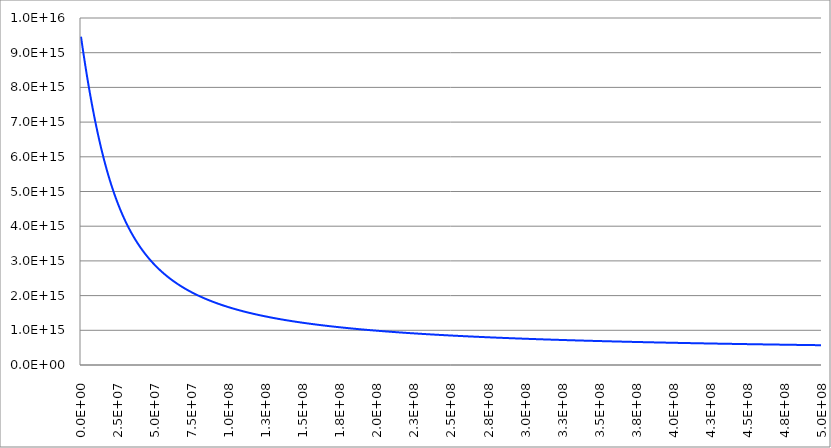
| Category | Series 1 | Series 0 | Series 2 |
|---|---|---|---|
| 0.0 |  |  | 9460730472580800 |
| 250000.0 |  |  | 9386088602967600 |
| 500000.0 |  |  | 9312059161777870 |
| 750000.0 |  |  | 9238641965022600 |
| 1000000.0 |  |  | 9165836706258070 |
| 1250000.0 |  |  | 9093642956892360 |
| 1500000.0 |  |  | 9022060166613310 |
| 1750000.0 |  |  | 8951087663937220 |
| 2000000.0 |  |  | 8880724656876750 |
| 2250000.0 |  |  | 8810970233726620 |
| 2500000.0 |  |  | 8741823363965320 |
| 2750000.0 |  |  | 8673282899270600 |
| 3000000.0 |  |  | 8605347574646660 |
| 3250000.0 |  |  | 8538016009660190 |
| 3500000.0 |  |  | 8471286709782780 |
| 3750000.0 |  |  | 8405158067836470 |
| 4000000.0 |  |  | 8339628365539280 |
| 4250000.0 |  |  | 8274695775147360 |
| 4500000.0 |  |  | 8210358361190130 |
| 4750000.0 |  |  | 8146614082294670 |
| 5000000.0 |  |  | 8083460793095420 |
| 5250000.0 |  |  | 8020896246225210 |
| 5500000.0 |  |  | 7958918094383340 |
| 5750000.0 |  |  | 7897523892476560 |
| 6000000.0 |  |  | 7836711099828500 |
| 6250000.0 |  |  | 7776477082453110 |
| 6500000.0 |  |  | 7716819115387610 |
| 6750000.0 |  |  | 7657734385080410 |
| 7000000.0 |  |  | 7599219991829400 |
| 7250000.0 |  |  | 7541272952265950 |
| 7500000.0 |  |  | 7483890201880120 |
| 7750000.0 |  |  | 7427068597582410 |
| 8000000.0 |  |  | 7370804920297470 |
| 8250000.0 |  |  | 7315095877585250 |
| 8500000.0 |  |  | 7259938106285140 |
| 8750000.0 |  |  | 7205328175178670 |
| 9000000.0 |  |  | 7151262587666280 |
| 9250000.0 |  |  | 7097737784454180 |
| 9500000.0 |  |  | 7044750146246840 |
| 9750000.0 |  |  | 6992295996441190 |
| 10000000.0 |  |  | 6940371603818580 |
| 10250000.0 |  |  | 6888973185230630 |
| 10500000.0 |  |  | 6838096908275190 |
| 10750000.0 |  |  | 6787738893959010 |
| 11000000.0 |  |  | 6737895219343470 |
| 11250000.0 |  |  | 6688561920170280 |
| 11500000.0 |  |  | 6639734993463790 |
| 11750000.0 |  |  | 6591410400107120 |
| 12000000.0 |  |  | 6543584067389070 |
| 12250000.0 |  |  | 6496251891519320 |
| 12500000.0 |  |  | 6449409740109170 |
| 12750000.0 |  |  | 6403053454615630 |
| 13000000.0 |  |  | 6357178852746540 |
| 13250000.0 |  |  | 6311781730824640 |
| 13500000.0 |  |  | 6266857866108840 |
| 13750000.0 |  |  | 6222403019070650 |
| 14000000.0 |  |  | 6178412935624510 |
| 14250000.0 |  |  | 6134883349310280 |
| 14500000.0 |  |  | 6091809983426770 |
| 14750000.0 |  |  | 6049188553115090 |
| 15000000.0 |  |  | 6007014767390770 |
| 15250000.0 |  |  | 5965284331123830 |
| 15500000.0 |  |  | 5923992946966010 |
| 15750000.0 |  |  | 5883136317224540 |
| 16000000.0 |  |  | 5842710145682030 |
| 16250000.0 |  |  | 5802710139361940 |
| 16500000.0 |  |  | 5763132010239590 |
| 16750000.0 |  |  | 5723971476898300 |
| 17000000.0 |  |  | 5685224266130920 |
| 17250000.0 |  |  | 5646886114486450 |
| 17500000.0 |  |  | 5608952769762230 |
| 17750000.0 |  |  | 5571419992441700 |
| 18000000.0 |  |  | 5534283557078210 |
| 18250000.0 |  |  | 5497539253625100 |
| 18500000.0 |  |  | 5461182888712780 |
| 18750000.0 |  |  | 5425210286873070 |
| 19000000.0 |  |  | 5389617291711630 |
| 19250000.0 |  |  | 5354399767029040 |
| 19500000.0 |  |  | 5319553597891310 |
| 19750000.0 |  |  | 5285074691650480 |
| 20000000.0 |  |  | 5250958978916320 |
| 20250000.0 |  |  | 5217202414479810 |
| 20500000.0 |  |  | 5183800978189420 |
| 20750000.0 |  |  | 5150750675781010 |
| 21000000.0 |  |  | 5118047539662500 |
| 21250000.0 |  |  | 5085687629654040 |
| 21500000.0 |  |  | 5053667033684950 |
| 21750000.0 |  |  | 5021981868448260 |
| 22000000.0 |  |  | 4990628280014020 |
| 22250000.0 |  |  | 4959602444402380 |
| 22500000.0 |  |  | 4928900568117510 |
| 22750000.0 |  |  | 4898518888643500 |
| 23000000.0 |  |  | 4868453674903220 |
| 23250000.0 |  |  | 4838701227681260 |
| 23500000.0 |  |  | 4809257880012120 |
| 23750000.0 |  |  | 4780119997534550 |
| 24000000.0 |  |  | 4751283978813310 |
| 24250000.0 |  |  | 4722746255629240 |
| 24500000.0 |  |  | 4694503293238850 |
| 24750000.0 |  |  | 4666551590604380 |
| 25000000.0 |  |  | 4638887680595390 |
| 25250000.0 |  |  | 4611508130162970 |
| 25500000.0 |  |  | 4584409540487470 |
| 25750000.0 |  |  | 4557588547100840 |
| 26000000.0 |  |  | 4531041819984540 |
| 26250000.0 |  |  | 4504766063643960 |
| 26500000.0 |  |  | 4478758017160300 |
| 26750000.0 |  |  | 4453014454220860 |
| 27000000.0 |  |  | 4427532183128710 |
| 27250000.0 |  |  | 4402308046792420 |
| 27500000.0 |  |  | 4377338922697000 |
| 27750000.0 |  |  | 4352621722856700 |
| 28000000.0 |  |  | 4328153393750530 |
| 28250000.0 |  |  | 4303930916241510 |
| 28500000.0 |  |  | 4279951305479990 |
| 28750000.0 |  |  | 4256211610792390 |
| 29000000.0 |  |  | 4232708915555590 |
| 29250000.0 |  |  | 4209440337058030 |
| 29500000.0 |  |  | 4186403026348040 |
| 29750000.0 |  |  | 4163594168070180 |
| 30000000.0 |  |  | 4141010980290260 |
| 30250000.0 |  |  | 4118650714309520 |
| 30500000.0 |  |  | 4096510654468860 |
| 30750000.0 |  |  | 4074588117943460 |
| 31000000.0 |  |  | 4052880454528580 |
| 31250000.0 |  |  | 4031385046416900 |
| 31500000.0 |  |  | 4010099307968140 |
| 31750000.0 |  |  | 3989020685471360 |
| 32000000.0 |  |  | 3968146656900440 |
| 32250000.0 |  |  | 3947474731663300 |
| 32500000.0 |  |  | 3927002450345250 |
| 32750000.0 |  |  | 3906727384447010 |
| 33000000.0 |  |  | 3886647136117700 |
| 33250000.0 |  |  | 3866759337883350 |
| 33500000.0 |  |  | 3847061652371220 |
| 33750000.0 |  |  | 3827551772030440 |
| 34000000.0 |  |  | 3808227418849120 |
| 34250000.0 |  |  | 3789086344068580 |
| 34500000.0 |  |  | 3770126327894770 |
| 34750000.0 |  |  | 3751345179207310 |
| 35000000.0 |  |  | 3732740735266480 |
| 35250000.0 |  |  | 3714310861418450 |
| 35500000.0 |  |  | 3696053450798930 |
| 35750000.0 |  |  | 3677966424035660 |
| 36000000.0 |  |  | 3660047728949900 |
| 36250000.0 |  |  | 3642295340257110 |
| 36500000.0 |  |  | 3624707259267270 |
| 36750000.0 |  |  | 3607281513584780 |
| 37000000.0 |  |  | 3590016156808320 |
| 37250000.0 |  |  | 3572909268230860 |
| 37500000.0 |  |  | 3555958952539980 |
| 37750000.0 |  |  | 3539163339518610 |
| 38000000.0 |  |  | 3522520583746510 |
| 38250000.0 |  |  | 3506028864302490 |
| 38500000.0 |  |  | 3489686384467680 |
| 38750000.0 |  |  | 3473491371429790 |
| 39000000.0 |  |  | 3457442075988780 |
| 39250000.0 |  |  | 3441536772263710 |
| 39500000.0 |  |  | 3425773757401200 |
| 39750000.0 |  |  | 3410151351285480 |
| 40000000.0 |  |  | 3394667896250070 |
| 40250000.0 |  |  | 3379321756791350 |
| 40500000.0 |  |  | 3364111319283950 |
| 40750000.0 |  |  | 3349034991698160 |
| 41000000.0 |  |  | 3334091203319370 |
| 41250000.0 |  |  | 3319278404469670 |
| 41500000.0 |  |  | 3304595066231600 |
| 41750000.0 |  |  | 3290039680174200 |
| 42000000.0 |  |  | 3275610758081370 |
| 42250000.0 |  |  | 3261306831682580 |
| 42500000.0 |  |  | 3247126452386020 |
| 42750000.0 |  |  | 3233068191014200 |
| 43000000.0 |  |  | 3219130637542090 |
| 43250000.0 |  |  | 3205312400837740 |
| 43500000.0 |  |  | 3191612108405520 |
| 43750000.0 |  |  | 3178028406131930 |
| 44000000.0 |  |  | 3164559958034090 |
| 44250000.0 |  |  | 3151205446010800 |
| 44500000.0 |  |  | 3137963569596320 |
| 44750000.0 |  |  | 3124833045716850 |
| 45000000.0 |  |  | 3111812608449650 |
| 45250000.0 |  |  | 3098901008784920 |
| 45500000.0 |  |  | 3086097014390370 |
| 45750000.0 |  |  | 3073399409378540 |
| 46000000.0 |  |  | 3060806994076810 |
| 46250000.0 |  |  | 3048318584800160 |
| 46500000.0 |  |  | 3035933013626630 |
| 46750000.0 |  |  | 3023649128175600 |
| 47000000.0 |  |  | 3011465791388650 |
| 47250000.0 |  |  | 2999381881313240 |
| 47500000.0 |  |  | 2987396290889040 |
| 47750000.0 |  |  | 2975507927737020 |
| 48000000.0 |  |  | 2963715713951170 |
| 48250000.0 |  |  | 2952018585892920 |
| 48500000.0 |  |  | 2940415493988200 |
| 48750000.0 |  |  | 2928905402527240 |
| 49000000.0 |  |  | 2917487289466840 |
| 49250000.0 |  |  | 2906160146235470 |
| 49500000.0 |  |  | 2894922977540760 |
| 49750000.0 |  |  | 2883774801179710 |
| 50000000.0 |  |  | 2872714647851440 |
| 50250000.0 |  |  | 2861741560972450 |
| 50500000.0 |  |  | 2850854596494450 |
| 50750000.0 |  |  | 2840052822724630 |
| 51000000.0 |  |  | 2829335320148490 |
| 51250000.0 |  |  | 2818701181255080 |
| 51500000.0 |  |  | 2808149510364690 |
| 51750000.0 |  |  | 2797679423458950 |
| 52000000.0 |  |  | 2787290048013360 |
| 52250000.0 |  |  | 2776980522832100 |
| 52500000.0 |  |  | 2766749997885290 |
| 52750000.0 |  |  | 2756597634148490 |
| 53000000.0 |  |  | 2746522603444540 |
| 53250000.0 |  |  | 2736524088287630 |
| 53500000.0 |  |  | 2726601281729670 |
| 53750000.0 |  |  | 2716753387208830 |
| 54000000.0 |  |  | 2706979618400270 |
| 54250000.0 |  |  | 2697279199069100 |
| 54500000.0 |  |  | 2687651362925440 |
| 54750000.0 |  |  | 2678095353481560 |
| 55000000.0 |  |  | 2668610423911200 |
| 55250000.0 |  |  | 2659195836910890 |
| 55500000.0 |  |  | 2649850864563330 |
| 55750000.0 |  |  | 2640574788202780 |
| 56000000.0 |  |  | 2631366898282460 |
| 56250000.0 |  |  | 2622226494243920 |
| 56500000.0 |  |  | 2613152884388260 |
| 56750000.0 |  |  | 2604145385749390 |
| 57000000.0 |  |  | 2595203323969110 |
| 57250000.0 |  |  | 2586326033174060 |
| 57500000.0 |  |  | 2577512855854490 |
| 57750000.0 |  |  | 2568763142744890 |
| 58000000.0 |  |  | 2560076252706360 |
| 58250000.0 |  |  | 2551451552610800 |
| 58500000.0 |  |  | 2542888417226780 |
| 58750000.0 |  |  | 2534386229107120 |
| 59000000.0 |  |  | 2525944378478260 |
| 59250000.0 |  |  | 2517562263131190 |
| 59500000.0 |  |  | 2509239288314040 |
| 59750000.0 |  |  | 2500974866626380 |
| 60000000.0 |  |  | 2492768417914960 |
| 60250000.0 |  |  | 2484619369171210 |
| 60500000.0 |  |  | 2476527154430120 |
| 60750000.0 |  |  | 2468491214670750 |
| 61000000.0 |  |  | 2460510997718250 |
| 61250000.0 |  |  | 2452585958147270 |
| 61500000.0 |  |  | 2444715557186960 |
| 61750000.0 |  |  | 2436899262627320 |
| 62000000.0 |  |  | 2429136548726980 |
| 62250000.0 |  |  | 2421426896122460 |
| 62500000.0 |  |  | 2413769791738620 |
| 62750000.0 |  |  | 2406164728700750 |
| 63000000.0 |  |  | 2398611206247710 |
| 63250000.0 |  |  | 2391108729646550 |
| 63500000.0 |  |  | 2383656810108410 |
| 63750000.0 |  |  | 2376254964705650 |
| 64000000.0 |  |  | 2368902716290270 |
| 64250000.0 |  |  | 2361599593413550 |
| 64500000.0 |  |  | 2354345130246950 |
| 64750000.0 |  |  | 2347138866504120 |
| 65000000.0 |  |  | 2339980347364200 |
| 65250000.0 |  |  | 2332869123396230 |
| 65500000.0 |  |  | 2325804750484700 |
| 65750000.0 |  |  | 2318786789756190 |
| 66000000.0 |  |  | 2311814807507260 |
| 66250000.0 |  |  | 2304888375133300 |
| 66500000.0 |  |  | 2298007069058450 |
| 66750000.0 |  |  | 2291170470666690 |
| 67000000.0 |  |  | 2284378166233880 |
| 67250000.0 |  |  | 2277629746860880 |
| 67500000.0 |  |  | 2270924808407620 |
| 67750000.0 |  |  | 2264262951428220 |
| 68000000.0 |  |  | 2257643781107100 |
| 68250000.0 |  |  | 2251066907195950 |
| 68500000.0 |  |  | 2244531943951810 |
| 68750000.0 |  |  | 2238038510075940 |
| 69000000.0 |  |  | 2231586228653690 |
| 69250000.0 |  |  | 2225174727095230 |
| 69500000.0 |  |  | 2218803637077220 |
| 69750000.0 |  |  | 2212472594485280 |
| 70000000.0 |  |  | 2206181239357440 |
| 70250000.0 |  |  | 2199929215828310 |
| 70500000.0 |  |  | 2193716172074180 |
| 70750000.0 |  |  | 2187541760258850 |
| 71000000.0 |  |  | 2181405636480410 |
| 71250000.0 |  |  | 2175307460718650 |
| 71500000.0 |  |  | 2169246896783410 |
| 71750000.0 |  |  | 2163223612263560 |
| 72000000.0 |  |  | 2157237278476860 |
| 72250000.0 |  |  | 2151287570420450 |
| 72500000.0 |  |  | 2145374166722230 |
| 72750000.0 |  |  | 2139496749592780 |
| 73000000.0 |  |  | 2133655004778140 |
| 73250000.0 |  |  | 2127848621513230 |
| 73500000.0 |  |  | 2122077292475940 |
| 73750000.0 |  |  | 2116340713741940 |
| 74000000.0 |  |  | 2110638584740140 |
| 74250000.0 |  |  | 2104970608208830 |
| 74500000.0 |  |  | 2099336490152420 |
| 74750000.0 |  |  | 2093735939798820 |
| 75000000.0 |  |  | 2088168669557560 |
| 75250000.0 |  |  | 2082634394978330 |
| 75500000.0 |  |  | 2077132834710290 |
| 75750000.0 |  |  | 2071663710461940 |
| 76000000.0 |  |  | 2066226746961500 |
| 76250000.0 |  |  | 2060821671917990 |
| 76500000.0 |  |  | 2055448215982770 |
| 76750000.0 |  |  | 2050106112711710 |
| 77000000.0 |  |  | 2044795098527900 |
| 77250000.0 |  |  | 2039514912684860 |
| 77500000.0 |  |  | 2034265297230350 |
| 77750000.0 |  |  | 2029045996970650 |
| 78000000.0 |  |  | 2023856759435400 |
| 78250000.0 |  |  | 2018697334842910 |
| 78500000.0 |  |  | 2013567476066000 |
| 78750000.0 |  |  | 2008466938598340 |
| 79000000.0 |  |  | 2003395480521240 |
| 79250000.0 |  |  | 1998352862470930 |
| 79500000.0 |  |  | 1993338847606350 |
| 79750000.0 |  |  | 1988353201577370 |
| 80000000.0 |  |  | 1983395692493420 |
| 80250000.0 |  |  | 1978466090892700 |
| 80500000.0 |  |  | 1973564169711660 |
| 80750000.0 |  |  | 1968689704255080 |
| 81000000.0 |  |  | 1963842472166440 |
| 81250000.0 |  |  | 1959022253398830 |
| 81500000.0 |  |  | 1954228830186160 |
| 81750000.0 |  |  | 1949461987014900 |
| 82000000.0 |  |  | 1944721510596090 |
| 82250000.0 |  |  | 1940007189837880 |
| 82500000.0 |  |  | 1935318815818350 |
| 82750000.0 |  |  | 1930656181758770 |
| 83000000.0 |  |  | 1926019082997210 |
| 83250000.0 |  |  | 1921407316962570 |
| 83500000.0 |  |  | 1916820683148910 |
| 83750000.0 |  |  | 1912258983090180 |
| 84000000.0 |  |  | 1907722020335320 |
| 84250000.0 |  |  | 1903209600423630 |
| 84500000.0 |  |  | 1898721530860600 |
| 84750000.0 |  |  | 1894257621093990 |
| 85000000.0 |  |  | 1889817682490260 |
| 85250000.0 |  |  | 1885401528311340 |
| 85500000.0 |  |  | 1881008973691780 |
| 85750000.0 |  |  | 1876639835616070 |
| 86000000.0 |  |  | 1872293932896410 |
| 86250000.0 |  |  | 1867971086150750 |
| 86500000.0 |  |  | 1863671117781110 |
| 86750000.0 |  |  | 1859393851952190 |
| 87000000.0 |  |  | 1855139114570360 |
| 87250000.0 |  |  | 1850906733262810 |
| 87500000.0 |  |  | 1846696537357120 |
| 87750000.0 |  |  | 1842508357860950 |
| 88000000.0 |  |  | 1838342027442220 |
| 88250000.0 |  |  | 1834197380409340 |
| 88500000.0 |  |  | 1830074252691890 |
| 88750000.0 |  |  | 1825972481821420 |
| 89000000.0 |  |  | 1821891906912640 |
| 89250000.0 |  |  | 1817832368644740 |
| 89500000.0 |  |  | 1813793709243080 |
| 89750000.0 |  |  | 1809775772461050 |
| 90000000.0 |  |  | 1805778403562200 |
| 90250000.0 |  |  | 1801801449302620 |
| 90500000.0 |  |  | 1797844757913520 |
| 90750000.0 |  |  | 1793908179084140 |
| 91000000.0 |  |  | 1789991563944710 |
| 91250000.0 |  |  | 1786094765049890 |
| 91500000.0 |  |  | 1782217636362160 |
| 91750000.0 |  |  | 1778360033235690 |
| 92000000.0 |  |  | 1774521812400170 |
| 92250000.0 |  |  | 1770702831945110 |
| 92500000.0 |  |  | 1766902951304140 |
| 92750000.0 |  |  | 1763122031239630 |
| 93000000.0 |  |  | 1759359933827510 |
| 93250000.0 |  |  | 1755616522442220 |
| 93500000.0 |  |  | 1751891661741960 |
| 93750000.0 |  |  | 1748185217654070 |
| 94000000.0 |  |  | 1744497057360580 |
| 94250000.0 |  |  | 1740827049284000 |
| 94500000.0 |  |  | 1737175063073330 |
| 94750000.0 |  |  | 1733540969590150 |
| 95000000.0 |  |  | 1729924640894980 |
| 95250000.0 |  |  | 1726325950233730 |
| 95500000.0 |  |  | 1722744772024490 |
| 95750000.0 |  |  | 1719180981844280 |
| 96000000.0 |  |  | 1715634456416120 |
| 96250000.0 |  |  | 1712105073596250 |
| 96500000.0 |  |  | 1708592712361450 |
| 96750000.0 |  |  | 1705097252796590 |
| 97000000.0 |  |  | 1701618576082320 |
| 97250000.0 |  |  | 1698156564482880 |
| 97500000.0 |  |  | 1694711101334160 |
| 97750000.0 |  |  | 1691282071031810 |
| 98000000.0 |  |  | 1687869359019570 |
| 98250000.0 |  |  | 1684472851777720 |
| 98500000.0 |  |  | 1681092436811700 |
| 98750000.0 |  |  | 1677728002640840 |
| 99000000.0 |  |  | 1674379438787290 |
| 99250000.0 |  |  | 1671046635765030 |
| 99500000.0 |  |  | 1667729485069040 |
| 99750000.0 |  |  | 1664427879164630 |
| 100000000.0 |  |  | 1661141711476920 |
| 100250000.0 |  |  | 1657870876380360 |
| 100500000.0 |  |  | 1654615269188500 |
| 100750000.0 |  |  | 1651374786143770 |
| 101000000.0 |  |  | 1648149324407550 |
| 101250000.0 |  |  | 1644938782050180 |
| 101500000.0 |  |  | 1641743058041220 |
| 101750000.0 |  |  | 1638562052239790 |
| 102000000.0 |  |  | 1635395665385060 |
| 102250000.0 |  |  | 1632243799086790 |
| 102500000.0 |  |  | 1629106355816070 |
| 102750000.0 |  |  | 1625983238896110 |
| 103000000.0 |  |  | 1622874352493220 |
| 103250000.0 |  |  | 1619779601607800 |
| 103500000.0 |  |  | 1616698892065530 |
| 103750000.0 |  |  | 1613632130508610 |
| 104000000.0 |  |  | 1610579224387180 |
| 104250000.0 |  |  | 1607540081950760 |
| 104500000.0 |  |  | 1604514612239830 |
| 104750000.0 |  |  | 1601502725077560 |
| 105000000.0 |  |  | 1598504331061550 |
| 105250000.0 |  |  | 1595519341555760 |
| 105500000.0 |  |  | 1592547668682480 |
| 105750000.0 |  |  | 1589589225314440 |
| 106000000.0 |  |  | 1586643925066960 |
| 106250000.0 |  |  | 1583711682290240 |
| 106500000.0 |  |  | 1580792412061780 |
| 106750000.0 |  |  | 1577886030178760 |
| 107000000.0 |  |  | 1574992453150680 |
| 107250000.0 |  |  | 1572111598191940 |
| 107500000.0 |  |  | 1569243383214650 |
| 107750000.0 |  |  | 1566387726821360 |
| 108000000.0 |  |  | 1563544548298060 |
| 108250000.0 |  |  | 1560713767607120 |
| 108500000.0 |  |  | 1557895305380380 |
| 108750000.0 |  |  | 1555089082912320 |
| 109000000.0 |  |  | 1552295022153300 |
| 109250000.0 |  |  | 1549513045702890 |
| 109500000.0 |  |  | 1546743076803250 |
| 109750000.0 |  |  | 1543985039332650 |
| 110000000.0 |  |  | 1541238857798990 |
| 110250000.0 |  |  | 1538504457333480 |
| 110500000.0 |  |  | 1535781763684290 |
| 110750000.0 |  |  | 1533070703210420 |
| 111000000.0 |  |  | 1530371202875450 |
| 111250000.0 |  |  | 1527683190241600 |
| 111500000.0 |  |  | 1525006593463600 |
| 111750000.0 |  |  | 1522341341282880 |
| 112000000.0 |  |  | 1519687363021620 |
| 112250000.0 |  |  | 1517044588577030 |
| 112500000.0 |  |  | 1514412948415580 |
| 112750000.0 |  |  | 1511792373567390 |
| 113000000.0 |  |  | 1509182795620590 |
| 113250000.0 |  |  | 1506584146715840 |
| 113500000.0 |  |  | 1503996359540830 |
| 113750000.0 |  |  | 1501419367324940 |
| 114000000.0 |  |  | 1498853103833860 |
| 114250000.0 |  |  | 1496297503364310 |
| 114500000.0 |  |  | 1493752500738880 |
| 114750000.0 |  |  | 1491218031300830 |
| 115000000.0 |  |  | 1488694030909030 |
| 115250000.0 |  |  | 1486180435932900 |
| 115500000.0 |  |  | 1483677183247420 |
| 115750000.0 |  |  | 1481184210228300 |
| 116000000.0 |  |  | 1478701454747020 |
| 116250000.0 |  |  | 1476228855166030 |
| 116500000.0 |  |  | 1473766350334060 |
| 116750000.0 |  |  | 1471313879581380 |
| 117000000.0 |  |  | 1468871382715130 |
| 117250000.0 |  |  | 1466438800014790 |
| 117500000.0 |  |  | 1464016072227600 |
| 117750000.0 |  |  | 1461603140564060 |
| 118000000.0 |  |  | 1459199946693520 |
| 118250000.0 |  |  | 1456806432739780 |
| 118500000.0 |  |  | 1454422541276740 |
| 118750000.0 |  |  | 1452048215324110 |
| 119000000.0 |  |  | 1449683398343180 |
| 119250000.0 |  |  | 1447328034232670 |
| 119500000.0 |  |  | 1444982067324450 |
| 119750000.0 |  |  | 1442645442379540 |
| 120000000.0 |  |  | 1440318104584080 |
| 120250000.0 |  |  | 1437999999545220 |
| 120500000.0 |  |  | 1435691073287230 |
| 120750000.0 |  |  | 1433391272247550 |
| 121000000.0 |  |  | 1431100543272880 |
| 121250000.0 |  |  | 1428818833615400 |
| 121500000.0 |  |  | 1426546090928960 |
| 121750000.0 |  |  | 1424282263265310 |
| 122000000.0 |  |  | 1422027299070380 |
| 122250000.0 |  |  | 1419781147180640 |
| 122500000.0 |  |  | 1417543756819460 |
| 122750000.0 |  |  | 1415315077593470 |
| 123000000.0 |  |  | 1413095059489140 |
| 123250000.0 |  |  | 1410883652869090 |
| 123500000.0 |  |  | 1408680808468750 |
| 123750000.0 |  |  | 1406486477392880 |
| 124000000.0 |  |  | 1404300611112150 |
| 124250000.0 |  |  | 1402123161459820 |
| 124500000.0 |  |  | 1399954080628380 |
| 124750000.0 |  |  | 1397793321166260 |
| 125000000.0 |  |  | 1395640835974580 |
| 125250000.0 |  |  | 1393496578303970 |
| 125500000.0 |  |  | 1391360501751320 |
| 125750000.0 |  |  | 1389232560256670 |
| 126000000.0 |  |  | 1387112708100100 |
| 126250000.0 |  |  | 1385000899898580 |
| 126500000.0 |  |  | 1382897090603020 |
| 126750000.0 |  |  | 1380801235495180 |
| 127000000.0 |  |  | 1378713290184690 |
| 127250000.0 |  |  | 1376633210606120 |
| 127500000.0 |  |  | 1374560953016060 |
| 127750000.0 |  |  | 1372496473990220 |
| 128000000.0 |  |  | 1370439730420500 |
| 128250000.0 |  |  | 1368390679512300 |
| 128500000.0 |  |  | 1366349278781620 |
| 128750000.0 |  |  | 1364315486052270 |
| 129000000.0 |  |  | 1362289259453220 |
| 129250000.0 |  |  | 1360270557415780 |
| 129500000.0 |  |  | 1358259338671010 |
| 129750000.0 |  |  | 1356255562247020 |
| 130000000.0 |  |  | 1354259187466300 |
| 130250000.0 |  |  | 1352270173943220 |
| 130500000.0 |  |  | 1350288481581340 |
| 130750000.0 |  |  | 1348314070570950 |
| 131000000.0 |  |  | 1346346901386500 |
| 131250000.0 |  |  | 1344386934784100 |
| 131500000.0 |  |  | 1342434131799140 |
| 131750000.0 |  |  | 1340488453743680 |
| 132000000.0 |  |  | 1338549862204220 |
| 132250000.0 |  |  | 1336618319039150 |
| 132500000.0 |  |  | 1334693786376480 |
| 132750000.0 |  |  | 1332776226611440 |
| 133000000.0 |  |  | 1330865602404190 |
| 133250000.0 |  |  | 1328961876677520 |
| 133500000.0 |  |  | 1327065012614540 |
| 133750000.0 |  |  | 1325174973656510 |
| 134000000.0 |  |  | 1323291723500500 |
| 134250000.0 |  |  | 1321415226097300 |
| 134500000.0 |  |  | 1319545445649170 |
| 134750000.0 |  |  | 1317682346607670 |
| 135000000.0 |  |  | 1315825893671600 |
| 135250000.0 |  |  | 1313976051784780 |
| 135500000.0 |  |  | 1312132786134040 |
| 135750000.0 |  |  | 1310296062147090 |
| 136000000.0 |  |  | 1308465845490530 |
| 136250000.0 |  |  | 1306642102067730 |
| 136500000.0 |  |  | 1304824798016890 |
| 136750000.0 |  |  | 1303013899709030 |
| 137000000.0 |  |  | 1301209373746000 |
| 137250000.0 |  |  | 1299411186958560 |
| 137500000.0 |  |  | 1297619306404420 |
| 137750000.0 |  |  | 1295833699366300 |
| 138000000.0 |  |  | 1294054333350130 |
| 138250000.0 |  |  | 1292281176083120 |
| 138500000.0 |  |  | 1290514195511820 |
| 138750000.0 |  |  | 1288753359800450 |
| 139000000.0 |  |  | 1286998637328950 |
| 139250000.0 |  |  | 1285249996691230 |
| 139500000.0 |  |  | 1283507406693380 |
| 139750000.0 |  |  | 1281770836351880 |
| 140000000.0 |  |  | 1280040254891900 |
| 140250000.0 |  |  | 1278315631745520 |
| 140500000.0 |  |  | 1276596936550040 |
| 140750000.0 |  |  | 1274884139146260 |
| 141000000.0 |  |  | 1273177209576860 |
| 141250000.0 |  |  | 1271476118084620 |
| 141500000.0 |  |  | 1269780835110900 |
| 141750000.0 |  |  | 1268091331293920 |
| 142000000.0 |  |  | 1266407577467180 |
| 142250000.0 |  |  | 1264729544657820 |
| 142500000.0 |  |  | 1263057204085110 |
| 142750000.0 |  |  | 1261390527158810 |
| 143000000.0 |  |  | 1259729485477620 |
| 143250000.0 |  |  | 1258074050827700 |
| 143500000.0 |  |  | 1256424195181070 |
| 143750000.0 |  |  | 1254779890694140 |
| 144000000.0 |  |  | 1253141109706220 |
| 144250000.0 |  |  | 1251507824737980 |
| 144500000.0 |  |  | 1249880008490100 |
| 144750000.0 |  |  | 1248257633841690 |
| 145000000.0 |  |  | 1246640673848900 |
| 145250000.0 |  |  | 1245029101743540 |
| 145500000.0 |  |  | 1243422890931580 |
| 145750000.0 |  |  | 1241822014991860 |
| 146000000.0 |  |  | 1240226447674540 |
| 146250000.0 |  |  | 1238636162899950 |
| 146500000.0 |  |  | 1237051134757020 |
| 146750000.0 |  |  | 1235471337502060 |
| 147000000.0 |  |  | 1233896745557400 |
| 147250000.0 |  |  | 1232327333510030 |
| 147500000.0 |  |  | 1230763076110350 |
| 147750000.0 |  |  | 1229203948270820 |
| 148000000.0 |  |  | 1227649925064710 |
| 148250000.0 |  |  | 1226100981724820 |
| 148500000.0 |  |  | 1224557093642240 |
| 148750000.0 |  |  | 1223018236365030 |
| 149000000.0 |  |  | 1221484385597060 |
| 149250000.0 |  |  | 1219955517196750 |
| 149500000.0 |  |  | 1218431607175900 |
| 149750000.0 |  |  | 1216912631698400 |
| 150000000.0 |  |  | 1215398567079100 |
| 150250000.0 |  |  | 1213889389782660 |
| 150500000.0 |  |  | 1212385076422290 |
| 150750000.0 |  |  | 1210885603758660 |
| 151000000.0 |  |  | 1209390948698740 |
| 151250000.0 |  |  | 1207901088294680 |
| 151500000.0 |  |  | 1206415999742580 |
| 151750000.0 |  |  | 1204935660381540 |
| 152000000.0 |  |  | 1203460047692440 |
| 152250000.0 |  |  | 1201989139296850 |
| 152500000.0 |  |  | 1200522912955980 |
| 152750000.0 |  |  | 1199061346569610 |
| 153000000.0 |  |  | 1197604418174940 |
| 153250000.0 |  |  | 1196152105945700 |
| 153500000.0 |  |  | 1194704388190890 |
| 153750000.0 |  |  | 1193261243353910 |
| 154000000.0 |  |  | 1191822650011500 |
| 154250000.0 |  |  | 1190388586872640 |
| 154500000.0 |  |  | 1188959032777620 |
| 154750000.0 |  |  | 1187533966697010 |
| 155000000.0 |  |  | 1186113367730710 |
| 155250000.0 |  |  | 1184697215106880 |
| 155500000.0 |  |  | 1183285488181050 |
| 155750000.0 |  |  | 1181878166435120 |
| 156000000.0 |  |  | 1180475229476430 |
| 156250000.0 |  |  | 1179076657036750 |
| 156500000.0 |  |  | 1177682428971410 |
| 156750000.0 |  |  | 1176292525258330 |
| 157000000.0 |  |  | 1174906925997140 |
| 157250000.0 |  |  | 1173525611408190 |
| 157500000.0 |  |  | 1172148561831730 |
| 157750000.0 |  |  | 1170775757726940 |
| 158000000.0 |  |  | 1169407179671100 |
| 158250000.0 |  |  | 1168042808358670 |
| 158500000.0 |  |  | 1166682624600430 |
| 158750000.0 |  |  | 1165326609322620 |
| 159000000.0 |  |  | 1163974743566020 |
| 159250000.0 |  |  | 1162627008485220 |
| 159500000.0 |  |  | 1161283385347670 |
| 159750000.0 |  |  | 1159943855532900 |
| 160000000.0 |  |  | 1158608400531650 |
| 160250000.0 |  |  | 1157277001945070 |
| 160500000.0 |  |  | 1155949641483940 |
| 160750000.0 |  |  | 1154626300967790 |
| 161000000.0 |  |  | 1153306962324170 |
| 161250000.0 |  |  | 1151991607587800 |
| 161500000.0 |  |  | 1150680218899820 |
| 161750000.0 |  |  | 1149372778506980 |
| 162000000.0 |  |  | 1148069268760950 |
| 162250000.0 |  |  | 1146769672117420 |
| 162500000.0 |  |  | 1145473971135440 |
| 162750000.0 |  |  | 1144182148476650 |
| 163000000.0 |  |  | 1142894186904490 |
| 163250000.0 |  |  | 1141610069283540 |
| 163500000.0 |  |  | 1140329778578710 |
| 163750000.0 |  |  | 1139053297854530 |
| 164000000.0 |  |  | 1137780610274470 |
| 164250000.0 |  |  | 1136511699100200 |
| 164500000.0 |  |  | 1135246547690850 |
| 164750000.0 |  |  | 1133985139502340 |
| 165000000.0 |  |  | 1132727458086700 |
| 165250000.0 |  |  | 1131473487091370 |
| 165500000.0 |  |  | 1130223210258460 |
| 165750000.0 |  |  | 1128976611424140 |
| 166000000.0 |  |  | 1127733674517950 |
| 166250000.0 |  |  | 1126494383562140 |
| 166500000.0 |  |  | 1125258722670940 |
| 166750000.0 |  |  | 1124026676050010 |
| 167000000.0 |  |  | 1122798227995710 |
| 167250000.0 |  |  | 1121573362894500 |
| 167500000.0 |  |  | 1120352065222270 |
| 167750000.0 |  |  | 1119134319543730 |
| 168000000.0 |  |  | 1117920110511750 |
| 168250000.0 |  |  | 1116709422866790 |
| 168500000.0 |  |  | 1115502241436200 |
| 168750000.0 |  |  | 1114298551133710 |
| 169000000.0 |  |  | 1113098336958740 |
| 169250000.0 |  |  | 1111901583995820 |
| 169500000.0 |  |  | 1110708277414020 |
| 169750000.0 |  |  | 1109518402466300 |
| 170000000.0 |  |  | 1108331944488980 |
| 170250000.0 |  |  | 1107148888901130 |
| 170500000.0 |  |  | 1105969221203990 |
| 170750000.0 |  |  | 1104792926980410 |
| 171000000.0 |  |  | 1103619991894270 |
| 171250000.0 |  |  | 1102450401689920 |
| 171500000.0 |  |  | 1101284142191610 |
| 171750000.0 |  |  | 1100121199302950 |
| 172000000.0 |  |  | 1098961559006370 |
| 172250000.0 |  |  | 1097805207362540 |
| 172500000.0 |  |  | 1096652130509860 |
| 172750000.0 |  |  | 1095502314663920 |
| 173000000.0 |  |  | 1094355746116960 |
| 173250000.0 |  |  | 1093212411237300 |
| 173500000.0 |  |  | 1092072296468930 |
| 173750000.0 |  |  | 1090935388330850 |
| 174000000.0 |  |  | 1089801673416680 |
| 174250000.0 |  |  | 1088671138394060 |
| 174500000.0 |  |  | 1087543770004200 |
| 174750000.0 |  |  | 1086419555061340 |
| 175000000.0 |  |  | 1085298480452260 |
| 175250000.0 |  |  | 1084180533135820 |
| 175500000.0 |  |  | 1083065700142420 |
| 175750000.0 |  |  | 1081953968573540 |
| 176000000.0 |  |  | 1080845325601250 |
| 176250000.0 |  |  | 1079739758467740 |
| 176500000.0 |  |  | 1078637254484850 |
| 176750000.0 |  |  | 1077537801033570 |
| 177000000.0 |  |  | 1076441385563590 |
| 177250000.0 |  |  | 1075347995592860 |
| 177500000.0 |  |  | 1074257618707100 |
| 177750000.0 |  |  | 1073170242559340 |
| 178000000.0 |  |  | 1072085854869480 |
| 178250000.0 |  |  | 1071004443423880 |
| 178500000.0 |  |  | 1069925996074830 |
| 178750000.0 |  |  | 1068850500740190 |
| 179000000.0 |  |  | 1067777945402880 |
| 179250000.0 |  |  | 1066708318110500 |
| 179500000.0 |  |  | 1065641606974920 |
| 179750000.0 |  |  | 1064577800171760 |
| 180000000.0 |  |  | 1063516885940020 |
| 180250000.0 |  |  | 1062458852581700 |
| 180500000.0 |  |  | 1061403688461340 |
| 180750000.0 |  |  | 1060351382005540 |
| 181000000.0 |  |  | 1059301921702660 |
| 181250000.0 |  |  | 1058255296102420 |
| 181500000.0 |  |  | 1057211493815340 |
| 181750000.0 |  |  | 1056170503512500 |
| 182000000.0 |  |  | 1055132313925100 |
| 182250000.0 |  |  | 1054096913844010 |
| 182500000.0 |  |  | 1053064292119420 |
| 182750000.0 |  |  | 1052034437660470 |
| 183000000.0 |  |  | 1051007339434820 |
| 183250000.0 |  |  | 1049982986468320 |
| 183500000.0 |  |  | 1048961367844540 |
| 183750000.0 |  |  | 1047942472704480 |
| 184000000.0 |  |  | 1046926290246200 |
| 184250000.0 |  |  | 1045912809724380 |
| 184500000.0 |  |  | 1044902020449980 |
| 184750000.0 |  |  | 1043893911789900 |
| 185000000.0 |  |  | 1042888473166610 |
| 185250000.0 |  |  | 1041885694057740 |
| 185500000.0 |  |  | 1040885563995800 |
| 185750000.0 |  |  | 1039888072567760 |
| 186000000.0 |  |  | 1038893209414770 |
| 186250000.0 |  |  | 1037900964231700 |
| 186500000.0 |  |  | 1036911326766920 |
| 186750000.0 |  |  | 1035924286821840 |
| 187000000.0 |  |  | 1034939834250720 |
| 187250000.0 |  |  | 1033957958960130 |
| 187500000.0 |  |  | 1032978650908780 |
| 187750000.0 |  |  | 1032001900107130 |
| 188000000.0 |  |  | 1031027696617040 |
| 188250000.0 |  |  | 1030056030551460 |
| 188500000.0 |  |  | 1029086892074120 |
| 188750000.0 |  |  | 1028120271399200 |
| 189000000.0 |  |  | 1027156158790950 |
| 189250000.0 |  |  | 1026194544563480 |
| 189500000.0 |  |  | 1025235419080340 |
| 189750000.0 |  |  | 1024278772754300 |
| 190000000.0 |  |  | 1023324596046940 |
| 190250000.0 |  |  | 1022372879468430 |
| 190500000.0 |  |  | 1021423613577180 |
| 190750000.0 |  |  | 1020476788979520 |
| 191000000.0 |  |  | 1019532396329450 |
| 191250000.0 |  |  | 1018590426328270 |
| 191500000.0 |  |  | 1017650869724400 |
| 191750000.0 |  |  | 1016713717312900 |
| 192000000.0 |  |  | 1015778959935370 |
| 192250000.0 |  |  | 1014846588479540 |
| 192500000.0 |  |  | 1013916593879020 |
| 192750000.0 |  |  | 1012988967113000 |
| 193000000.0 |  |  | 1012063699205990 |
| 193250000.0 |  |  | 1011140781227520 |
| 193500000.0 |  |  | 1010220204291860 |
| 193750000.0 |  |  | 1009301959557730 |
| 194000000.0 |  |  | 1008386038228040 |
| 194250000.0 |  |  | 1007472431549650 |
| 194500000.0 |  |  | 1006561130813020 |
| 194750000.0 |  |  | 1005652127351990 |
| 195000000.0 |  |  | 1004745412543530 |
| 195250000.0 |  |  | 1003840977807420 |
| 195500000.0 |  |  | 1002938814606010 |
| 195750000.0 |  |  | 1002038914444000 |
| 196000000.0 |  |  | 1001141268868100 |
| 196250000.0 |  |  | 1000245869466840 |
| 196500000.0 |  |  | 999352707870272 |
| 196750000.0 |  |  | 998461775749736 |
| 197000000.0 |  |  | 997573064817600 |
| 197250000.0 |  |  | 996686566827032 |
| 197500000.0 |  |  | 995802273571704 |
| 197750000.0 |  |  | 994920176885560 |
| 198000000.0 |  |  | 994040268642624 |
| 198250000.0 |  |  | 993162540756696 |
| 198500000.0 |  |  | 992286985181088 |
| 198750000.0 |  |  | 991413593908488 |
| 199000000.0 |  |  | 990542358970640 |
| 199250000.0 |  |  | 989673272438088 |
| 199500000.0 |  |  | 988806326420008 |
| 199750000.0 |  |  | 987941513063960 |
| 200000000.0 |  |  | 987078824555616 |
| 200250000.0 |  |  | 986218253118568 |
| 200500000.0 |  |  | 985359791014064 |
| 200750000.0 |  |  | 984503430540832 |
| 201000000.0 |  |  | 983649164034840 |
| 201250000.0 |  |  | 982796983869008 |
| 201500000.0 |  |  | 981946882453096 |
| 201750000.0 |  |  | 981098852233400 |
| 202000000.0 |  |  | 980252885692552 |
| 202250000.0 |  |  | 979408975349320 |
| 202500000.0 |  |  | 978567113758392 |
| 202750000.0 |  |  | 977727293510152 |
| 203000000.0 |  |  | 976889507230432 |
| 203250000.0 |  |  | 976053747580400 |
| 203500000.0 |  |  | 975220007256248 |
| 203750000.0 |  |  | 974388278989048 |
| 204000000.0 |  |  | 973558555544472 |
| 204250000.0 |  |  | 972730829722696 |
| 204500000.0 |  |  | 971905094358128 |
| 204750000.0 |  |  | 971081342319176 |
| 205000000.0 |  |  | 970259566508128 |
| 205250000.0 |  |  | 969439759860896 |
| 205500000.0 |  |  | 968621915346824 |
| 205750000.0 |  |  | 967806025968528 |
| 206000000.0 |  |  | 966992084761640 |
| 206250000.0 |  |  | 966180084794664 |
| 206500000.0 |  |  | 965370019168784 |
| 206750000.0 |  |  | 964561881017616 |
| 207000000.0 |  |  | 963755663507096 |
| 207250000.0 |  |  | 962951359835232 |
| 207500000.0 |  |  | 962148963231968 |
| 207750000.0 |  |  | 961348466958928 |
| 208000000.0 |  |  | 960549864309288 |
| 208250000.0 |  |  | 959753148607592 |
| 208500000.0 |  |  | 958958313209544 |
| 208750000.0 |  |  | 958165351501840 |
| 209000000.0 |  |  | 957374256901992 |
| 209250000.0 |  |  | 956585022858120 |
| 209500000.0 |  |  | 955797642848848 |
| 209750000.0 |  |  | 955012110383024 |
| 210000000.0 |  |  | 954228418999640 |
| 210250000.0 |  |  | 953446562267632 |
| 210500000.0 |  |  | 952666533785616 |
| 210750000.0 |  |  | 951888327181904 |
| 211000000.0 |  |  | 951111936114144 |
| 211250000.0 |  |  | 950337354269304 |
| 211500000.0 |  |  | 949564575363352 |
| 211750000.0 |  |  | 948793593141240 |
| 212000000.0 |  |  | 948024401376656 |
| 212250000.0 |  |  | 947256993871856 |
| 212500000.0 |  |  | 946491364457520 |
| 212750000.0 |  |  | 945727506992624 |
| 213000000.0 |  |  | 944965415364200 |
| 213250000.0 |  |  | 944205083487264 |
| 213500000.0 |  |  | 943446505304576 |
| 213750000.0 |  |  | 942689674786552 |
| 214000000.0 |  |  | 941934585931064 |
| 214250000.0 |  |  | 941181232763288 |
| 214500000.0 |  |  | 940429609335584 |
| 214750000.0 |  |  | 939679709727280 |
| 215000000.0 |  |  | 938931528044600 |
| 215250000.0 |  |  | 938185058420448 |
| 215500000.0 |  |  | 937440295014264 |
| 215750000.0 |  |  | 936697232011920 |
| 216000000.0 |  |  | 935955863625536 |
| 216250000.0 |  |  | 935216184093328 |
| 216500000.0 |  |  | 934478187679464 |
| 216750000.0 |  |  | 933741868673952 |
| 217000000.0 |  |  | 933007221392480 |
| 217250000.0 |  |  | 932274240176200 |
| 217500000.0 |  |  | 931542919391728 |
| 217750000.0 |  |  | 930813253430880 |
| 218000000.0 |  |  | 930085236710576 |
| 218250000.0 |  |  | 929358863672704 |
| 218500000.0 |  |  | 928634128783992 |
| 218750000.0 |  |  | 927911026535848 |
| 219000000.0 |  |  | 927189551444200 |
| 219250000.0 |  |  | 926469698049432 |
| 219500000.0 |  |  | 925751460916200 |
| 219750000.0 |  |  | 925034834633288 |
| 220000000.0 |  |  | 924319813813488 |
| 220250000.0 |  |  | 923606393093496 |
| 220500000.0 |  |  | 922894567133760 |
| 220750000.0 |  |  | 922184330618296 |
| 221000000.0 |  |  | 921475678254664 |
| 221250000.0 |  |  | 920768604773744 |
| 221500000.0 |  |  | 920063104929680 |
| 221750000.0 |  |  | 919359173499680 |
| 222000000.0 |  |  | 918656805283960 |
| 222250000.0 |  |  | 917955995105568 |
| 222500000.0 |  |  | 917256737810320 |
| 222750000.0 |  |  | 916559028266560 |
| 223000000.0 |  |  | 915862861365168 |
| 223250000.0 |  |  | 915168232019384 |
| 223500000.0 |  |  | 914475135164632 |
| 223750000.0 |  |  | 913783565758504 |
| 224000000.0 |  |  | 913093518780568 |
| 224250000.0 |  |  | 912404989232256 |
| 224500000.0 |  |  | 911717972136768 |
| 224750000.0 |  |  | 911032462538952 |
| 225000000.0 |  |  | 910348455505144 |
| 225250000.0 |  |  | 909665946123136 |
| 225500000.0 |  |  | 908984929501968 |
| 225750000.0 |  |  | 908305400771880 |
| 226000000.0 |  |  | 907627355084152 |
| 226250000.0 |  |  | 906950787611056 |
| 226500000.0 |  |  | 906275693545648 |
| 226750000.0 |  |  | 905602068101720 |
| 227000000.0 |  |  | 904929906513728 |
| 227250000.0 |  |  | 904259204036544 |
| 227500000.0 |  |  | 903589955945528 |
| 227750000.0 |  |  | 902922157536240 |
| 228000000.0 |  |  | 902255804124488 |
| 228250000.0 |  |  | 901590891046088 |
| 228500000.0 |  |  | 900927413656848 |
| 228750000.0 |  |  | 900265367332440 |
| 229000000.0 |  |  | 899604747468280 |
| 229250000.0 |  |  | 898945549479400 |
| 229500000.0 |  |  | 898287768800424 |
| 229750000.0 |  |  | 897631400885360 |
| 230000000.0 |  |  | 896976441207608 |
| 230250000.0 |  |  | 896322885259736 |
| 230500000.0 |  |  | 895670728553496 |
| 230750000.0 |  |  | 895019966619640 |
| 231000000.0 |  |  | 894370595007880 |
| 231250000.0 |  |  | 893722609286720 |
| 231500000.0 |  |  | 893076005043408 |
| 231750000.0 |  |  | 892430777883864 |
| 232000000.0 |  |  | 891786923432456 |
| 232250000.0 |  |  | 891144437332080 |
| 232500000.0 |  |  | 890503315243928 |
| 232750000.0 |  |  | 889863552847448 |
| 233000000.0 |  |  | 889225145840208 |
| 233250000.0 |  |  | 888588089937864 |
| 233500000.0 |  |  | 887952380874048 |
| 233750000.0 |  |  | 887318014400224 |
| 234000000.0 |  |  | 886684986285632 |
| 234250000.0 |  |  | 886053292317200 |
| 234500000.0 |  |  | 885422928299456 |
| 234750000.0 |  |  | 884793890054432 |
| 235000000.0 |  |  | 884166173421528 |
| 235250000.0 |  |  | 883539774257496 |
| 235500000.0 |  |  | 882914688436328 |
| 235750000.0 |  |  | 882290911849104 |
| 236000000.0 |  |  | 881668440404008 |
| 236250000.0 |  |  | 881047270026144 |
| 236500000.0 |  |  | 880427396657528 |
| 236750000.0 |  |  | 879808816256928 |
| 237000000.0 |  |  | 879191524799832 |
| 237250000.0 |  |  | 878575518278360 |
| 237500000.0 |  |  | 877960792701120 |
| 237750000.0 |  |  | 877347344093184 |
| 238000000.0 |  |  | 876735168496032 |
| 238250000.0 |  |  | 876124261967360 |
| 238500000.0 |  |  | 875514620581072 |
| 238750000.0 |  |  | 874906240427200 |
| 239000000.0 |  |  | 874299117611776 |
| 239250000.0 |  |  | 873693248256848 |
| 239500000.0 |  |  | 873088628500224 |
| 239750000.0 |  |  | 872485254495616 |
| 240000000.0 |  |  | 871883122412320 |
| 240250000.0 |  |  | 871282228435360 |
| 240500000.0 |  |  | 870682568765264 |
| 240750000.0 |  |  | 870084139618016 |
| 241000000.0 |  |  | 869486937225024 |
| 241250000.0 |  |  | 868890957832960 |
| 241500000.0 |  |  | 868296197703776 |
| 241750000.0 |  |  | 867702653114560 |
| 242000000.0 |  |  | 867110320357472 |
| 242250000.0 |  |  | 866519195739712 |
| 242500000.0 |  |  | 865929275583360 |
| 242750000.0 |  |  | 865340556225376 |
| 243000000.0 |  |  | 864753034017536 |
| 243250000.0 |  |  | 864166705326240 |
| 243500000.0 |  |  | 863581566532576 |
| 243750000.0 |  |  | 862997614032192 |
| 244000000.0 |  |  | 862414844235216 |
| 244250000.0 |  |  | 861833253566176 |
| 244500000.0 |  |  | 861252838463936 |
| 244750000.0 |  |  | 860673595381648 |
| 245000000.0 |  |  | 860095520786624 |
| 245250000.0 |  |  | 859518611160400 |
| 245500000.0 |  |  | 858942862998464 |
| 245750000.0 |  |  | 858368272810336 |
| 246000000.0 |  |  | 857794837119456 |
| 246250000.0 |  |  | 857222552463120 |
| 246500000.0 |  |  | 856651415392368 |
| 246750000.0 |  |  | 856081422472000 |
| 247000000.0 |  |  | 855512570280448 |
| 247250000.0 |  |  | 854944855409664 |
| 247500000.0 |  |  | 854378274465216 |
| 247750000.0 |  |  | 853812824066000 |
| 248000000.0 |  |  | 853248500844384 |
| 248250000.0 |  |  | 852685301446016 |
| 248500000.0 |  |  | 852123222529760 |
| 248750000.0 |  |  | 851562260767712 |
| 249000000.0 |  |  | 851002412845024 |
| 249250000.0 |  |  | 850443675459936 |
| 249500000.0 |  |  | 849886045323712 |
| 249750000.0 |  |  | 849329519160480 |
| 250000000.0 |  |  | 848774093707264 |
| 250250000.0 |  |  | 848219765713824 |
| 250500000.0 |  |  | 847666531942768 |
| 250750000.0 |  |  | 847114389169280 |
| 251000000.0 |  |  | 846563334181184 |
| 251250000.0 |  |  | 846013363778880 |
| 251500000.0 |  |  | 845464474775264 |
| 251750000.0 |  |  | 844916663995600 |
| 252000000.0 |  |  | 844369928277600 |
| 252250000.0 |  |  | 843824264471184 |
| 252500000.0 |  |  | 843279669438608 |
| 252750000.0 |  |  | 842736140054304 |
| 253000000.0 |  |  | 842193673204832 |
| 253250000.0 |  |  | 841652265788768 |
| 253500000.0 |  |  | 841111914716800 |
| 253750000.0 |  |  | 840572616911488 |
| 254000000.0 |  |  | 840034369307344 |
| 254250000.0 |  |  | 839497168850688 |
| 254500000.0 |  |  | 838961012499616 |
| 254750000.0 |  |  | 838425897224032 |
| 255000000.0 |  |  | 837891820005408 |
| 255250000.0 |  |  | 837358777836880 |
| 255500000.0 |  |  | 836826767723200 |
| 255750000.0 |  |  | 836295786680480 |
| 256000000.0 |  |  | 835765831736432 |
| 256250000.0 |  |  | 835236899930064 |
| 256500000.0 |  |  | 834708988311776 |
| 256750000.0 |  |  | 834182093943232 |
| 257000000.0 |  |  | 833656213897376 |
| 257250000.0 |  |  | 833131345258256 |
| 257500000.0 |  |  | 832607485121120 |
| 257750000.0 |  |  | 832084630592176 |
| 258000000.0 |  |  | 831562778788800 |
| 258250000.0 |  |  | 831041926839232 |
| 258500000.0 |  |  | 830522071882720 |
| 258750000.0 |  |  | 830003211069216 |
| 259000000.0 |  |  | 829485341559712 |
| 259250000.0 |  |  | 828968460525776 |
| 259500000.0 |  |  | 828452565149760 |
| 259750000.0 |  |  | 827937652624704 |
| 260000000.0 |  |  | 827423720154176 |
| 260250000.0 |  |  | 826910764952416 |
| 260500000.0 |  |  | 826398784244064 |
| 260750000.0 |  |  | 825887775264304 |
| 261000000.0 |  |  | 825377735258704 |
| 261250000.0 |  |  | 824868661483216 |
| 261500000.0 |  |  | 824360551204064 |
| 261750000.0 |  |  | 823853401697776 |
| 262000000.0 |  |  | 823347210251104 |
| 262250000.0 |  |  | 822841974160896 |
| 262500000.0 |  |  | 822337690734288 |
| 262750000.0 |  |  | 821834357288320 |
| 263000000.0 |  |  | 821331971150176 |
| 263250000.0 |  |  | 820830529656960 |
| 263500000.0 |  |  | 820330030155712 |
| 263750000.0 |  |  | 819830470003456 |
| 264000000.0 |  |  | 819331846566912 |
| 264250000.0 |  |  | 818834157222752 |
| 264500000.0 |  |  | 818337399357296 |
| 264750000.0 |  |  | 817841570366624 |
| 265000000.0 |  |  | 817346667656480 |
| 265250000.0 |  |  | 816852688642144 |
| 265500000.0 |  |  | 816359630748608 |
| 265750000.0 |  |  | 815867491410304 |
| 266000000.0 |  |  | 815376268071184 |
| 266250000.0 |  |  | 814885958184608 |
| 266500000.0 |  |  | 814396559213408 |
| 266750000.0 |  |  | 813908068629680 |
| 267000000.0 |  |  | 813420483914912 |
| 267250000.0 |  |  | 812933802559808 |
| 267500000.0 |  |  | 812448022064352 |
| 267750000.0 |  |  | 811963139937664 |
| 268000000.0 |  |  | 811479153698080 |
| 268250000.0 |  |  | 810996060872912 |
| 268500000.0 |  |  | 810513858998688 |
| 268750000.0 |  |  | 810032545620832 |
| 269000000.0 |  |  | 809552118293808 |
| 269250000.0 |  |  | 809072574581008 |
| 269500000.0 |  |  | 808593912054736 |
| 269750000.0 |  |  | 808116128296096 |
| 270000000.0 |  |  | 807639220895072 |
| 270250000.0 |  |  | 807163187450400 |
| 270500000.0 |  |  | 806688025569552 |
| 270750000.0 |  |  | 806213732868704 |
| 271000000.0 |  |  | 805740306972656 |
| 271250000.0 |  |  | 805267745514880 |
| 271500000.0 |  |  | 804796046137392 |
| 271750000.0 |  |  | 804325206490752 |
| 272000000.0 |  |  | 803855224234048 |
| 272250000.0 |  |  | 803386097034800 |
| 272500000.0 |  |  | 802917822568992 |
| 272750000.0 |  |  | 802450398520944 |
| 273000000.0 |  |  | 801983822583360 |
| 273250000.0 |  |  | 801518092457264 |
| 273500000.0 |  |  | 801053205851904 |
| 273750000.0 |  |  | 800589160484864 |
| 274000000.0 |  |  | 800125954081840 |
| 274250000.0 |  |  | 799663584376736 |
| 274500000.0 |  |  | 799202049111568 |
| 274750000.0 |  |  | 798741346036432 |
| 275000000.0 |  |  | 798281472909536 |
| 275250000.0 |  |  | 797822427497040 |
| 275500000.0 |  |  | 797364207573120 |
| 275750000.0 |  |  | 796906810919920 |
| 276000000.0 |  |  | 796450235327456 |
| 276250000.0 |  |  | 795994478593680 |
| 276500000.0 |  |  | 795539538524304 |
| 276750000.0 |  |  | 795085412932896 |
| 277000000.0 |  |  | 794632099640848 |
| 277250000.0 |  |  | 794179596477200 |
| 277500000.0 |  |  | 793727901278768 |
| 277750000.0 |  |  | 793277011889968 |
| 278000000.0 |  |  | 792826926162960 |
| 278250000.0 |  |  | 792377641957376 |
| 278500000.0 |  |  | 791929157140544 |
| 278750000.0 |  |  | 791481469587232 |
| 279000000.0 |  |  | 791034577179776 |
| 279250000.0 |  |  | 790588477807968 |
| 279500000.0 |  |  | 790143169368976 |
| 279750000.0 |  |  | 789698649767488 |
| 280000000.0 |  |  | 789254916915488 |
| 280250000.0 |  |  | 788811968732288 |
| 280500000.0 |  |  | 788369803144560 |
| 280750000.0 |  |  | 787928418086192 |
| 281000000.0 |  |  | 787487811498400 |
| 281250000.0 |  |  | 787047981329568 |
| 281500000.0 |  |  | 786608925535216 |
| 281750000.0 |  |  | 786170642078128 |
| 282000000.0 |  |  | 785733128928064 |
| 282250000.0 |  |  | 785296384061968 |
| 282500000.0 |  |  | 784860405463840 |
| 282750000.0 |  |  | 784425191124656 |
| 283000000.0 |  |  | 783990739042448 |
| 283250000.0 |  |  | 783557047222176 |
| 283500000.0 |  |  | 783124113675760 |
| 283750000.0 |  |  | 782691936421984 |
| 284000000.0 |  |  | 782260513486544 |
| 284250000.0 |  |  | 781829842901936 |
| 284500000.0 |  |  | 781399922707568 |
| 284750000.0 |  |  | 780970750949536 |
| 285000000.0 |  |  | 780542325680752 |
| 285250000.0 |  |  | 780114644960848 |
| 285500000.0 |  |  | 779687706856112 |
| 285750000.0 |  |  | 779261509439552 |
| 286000000.0 |  |  | 778836050790800 |
| 286250000.0 |  |  | 778411328996144 |
| 286500000.0 |  |  | 777987342148352 |
| 286750000.0 |  |  | 777564088346864 |
| 287000000.0 |  |  | 777141565697584 |
| 287250000.0 |  |  | 776719772312928 |
| 287500000.0 |  |  | 776298706311840 |
| 287750000.0 |  |  | 775878365819568 |
| 288000000.0 |  |  | 775458748967952 |
| 288250000.0 |  |  | 775039853895120 |
| 288500000.0 |  |  | 774621678745584 |
| 288750000.0 |  |  | 774204221670176 |
| 289000000.0 |  |  | 773787480826080 |
| 289250000.0 |  |  | 773371454376768 |
| 289500000.0 |  |  | 772956140491888 |
| 289750000.0 |  |  | 772541537347376 |
| 290000000.0 |  |  | 772127643125392 |
| 290250000.0 |  |  | 771714456014208 |
| 290500000.0 |  |  | 771301974208320 |
| 290750000.0 |  |  | 770890195908304 |
| 291000000.0 |  |  | 770479119320832 |
| 291250000.0 |  |  | 770068742658688 |
| 291500000.0 |  |  | 769659064140656 |
| 291750000.0 |  |  | 769250081991536 |
| 292000000.0 |  |  | 768841794442208 |
| 292250000.0 |  |  | 768434199729440 |
| 292500000.0 |  |  | 768027296095952 |
| 292750000.0 |  |  | 767621081790448 |
| 293000000.0 |  |  | 767215555067472 |
| 293250000.0 |  |  | 766810714187440 |
| 293500000.0 |  |  | 766406557416640 |
| 293750000.0 |  |  | 766003083027168 |
| 294000000.0 |  |  | 765600289296944 |
| 294250000.0 |  |  | 765198174509632 |
| 294500000.0 |  |  | 764796736954656 |
| 294750000.0 |  |  | 764395974927168 |
| 295000000.0 |  |  | 763995886728016 |
| 295250000.0 |  |  | 763596470663712 |
| 295500000.0 |  |  | 763197725046464 |
| 295750000.0 |  |  | 762799648194064 |
| 296000000.0 |  |  | 762402238429984 |
| 296250000.0 |  |  | 762005494083200 |
| 296500000.0 |  |  | 761609413488288 |
| 296750000.0 |  |  | 761213994985376 |
| 297000000.0 |  |  | 760819236920032 |
| 297250000.0 |  |  | 760425137643424 |
| 297500000.0 |  |  | 760031695512112 |
| 297750000.0 |  |  | 759638908888160 |
| 298000000.0 |  |  | 759246776138992 |
| 298250000.0 |  |  | 758855295637488 |
| 298500000.0 |  |  | 758464465761888 |
| 298750000.0 |  |  | 758074284895808 |
| 299000000.0 |  |  | 757684751428144 |
| 299250000.0 |  |  | 757295863753168 |
| 299500000.0 |  |  | 756907620270400 |
| 299750000.0 |  |  | 756520019384688 |
| 300000000.0 |  |  | 756133059506064 |
| 300250000.0 |  |  | 755746739049840 |
| 300500000.0 |  |  | 755361056436480 |
| 300750000.0 |  |  | 754976010091680 |
| 301000000.0 |  |  | 754591598446288 |
| 301250000.0 |  |  | 754207819936256 |
| 301500000.0 |  |  | 753824673002720 |
| 301750000.0 |  |  | 753442156091872 |
| 302000000.0 |  |  | 753060267654992 |
| 302250000.0 |  |  | 752679006148432 |
| 302500000.0 |  |  | 752298370033600 |
| 302750000.0 |  |  | 751918357776832 |
| 303000000.0 |  |  | 751538967849584 |
| 303250000.0 |  |  | 751160198728192 |
| 303500000.0 |  |  | 750782048894016 |
| 303750000.0 |  |  | 750404516833312 |
| 304000000.0 |  |  | 750027601037248 |
| 304250000.0 |  |  | 749651300001952 |
| 304500000.0 |  |  | 749275612228336 |
| 304750000.0 |  |  | 748900536222240 |
| 305000000.0 |  |  | 748526070494304 |
| 305250000.0 |  |  | 748152213560016 |
| 305500000.0 |  |  | 747778963939648 |
| 305750000.0 |  |  | 747406320158224 |
| 306000000.0 |  |  | 747034280745616 |
| 306250000.0 |  |  | 746662844236320 |
| 306500000.0 |  |  | 746292009169616 |
| 306750000.0 |  |  | 745921774089520 |
| 307000000.0 |  |  | 745552137544640 |
| 307250000.0 |  |  | 745183098088352 |
| 307500000.0 |  |  | 744814654278624 |
| 307750000.0 |  |  | 744446804678064 |
| 308000000.0 |  |  | 744079547853856 |
| 308250000.0 |  |  | 743712882377840 |
| 308500000.0 |  |  | 743346806826336 |
| 308750000.0 |  |  | 742981319780352 |
| 309000000.0 |  |  | 742616419825296 |
| 309250000.0 |  |  | 742252105551184 |
| 309500000.0 |  |  | 741888375552528 |
| 309750000.0 |  |  | 741525228428256 |
| 310000000.0 |  |  | 741162662781840 |
| 310250000.0 |  |  | 740800677221120 |
| 310500000.0 |  |  | 740439270358432 |
| 310750000.0 |  |  | 740078440810528 |
| 311000000.0 |  |  | 739718187198480 |
| 311250000.0 |  |  | 739358508147792 |
| 311500000.0 |  |  | 738999402288352 |
| 311750000.0 |  |  | 738640868254368 |
| 312000000.0 |  |  | 738282904684304 |
| 312250000.0 |  |  | 737925510221024 |
| 312500000.0 |  |  | 737568683511664 |
| 312750000.0 |  |  | 737212423207600 |
| 313000000.0 |  |  | 736856727964496 |
| 313250000.0 |  |  | 736501596442256 |
| 313500000.0 |  |  | 736147027304992 |
| 313750000.0 |  |  | 735793019221056 |
| 314000000.0 |  |  | 735439570862912 |
| 314250000.0 |  |  | 735086680907296 |
| 314500000.0 |  |  | 734734348035056 |
| 314750000.0 |  |  | 734382570931200 |
| 315000000.0 |  |  | 734031348284800 |
| 315250000.0 |  |  | 733680678789120 |
| 315500000.0 |  |  | 733330561141504 |
| 315750000.0 |  |  | 732980994043312 |
| 316000000.0 |  |  | 732631976200016 |
| 316250000.0 |  |  | 732283506321136 |
| 316500000.0 |  |  | 731935583120192 |
| 316750000.0 |  |  | 731588205314768 |
| 317000000.0 |  |  | 731241371626384 |
| 317250000.0 |  |  | 730895080780608 |
| 317500000.0 |  |  | 730549331506944 |
| 317750000.0 |  |  | 730204122538784 |
| 318000000.0 |  |  | 729859452613568 |
| 318250000.0 |  |  | 729515320472624 |
| 318500000.0 |  |  | 729171724861136 |
| 318750000.0 |  |  | 728828664528240 |
| 319000000.0 |  |  | 728486138226928 |
| 319250000.0 |  |  | 728144144714080 |
| 319500000.0 |  |  | 727802682750320 |
| 319750000.0 |  |  | 727461751100208 |
| 320000000.0 |  |  | 727121348532128 |
| 320250000.0 |  |  | 726781473818176 |
| 320500000.0 |  |  | 726442125734304 |
| 320750000.0 |  |  | 726103303060256 |
| 321000000.0 |  |  | 725765004579456 |
| 321250000.0 |  |  | 725427229079152 |
| 321500000.0 |  |  | 725089975350240 |
| 321750000.0 |  |  | 724753242187424 |
| 322000000.0 |  |  | 724417028389040 |
| 322250000.0 |  |  | 724081332757152 |
| 322500000.0 |  |  | 723746154097472 |
| 322750000.0 |  |  | 723411491219344 |
| 323000000.0 |  |  | 723077342935888 |
| 323250000.0 |  |  | 722743708063648 |
| 323500000.0 |  |  | 722410585422960 |
| 323750000.0 |  |  | 722077973837664 |
| 324000000.0 |  |  | 721745872135248 |
| 324250000.0 |  |  | 721414279146768 |
| 324500000.0 |  |  | 721083193706816 |
| 324750000.0 |  |  | 720752614653536 |
| 325000000.0 |  |  | 720422540828640 |
| 325250000.0 |  |  | 720092971077312 |
| 325500000.0 |  |  | 719763904248304 |
| 325750000.0 |  |  | 719435339193792 |
| 326000000.0 |  |  | 719107274769472 |
| 326250000.0 |  |  | 718779709834576 |
| 326500000.0 |  |  | 718452643251664 |
| 326750000.0 |  |  | 718126073886864 |
| 327000000.0 |  |  | 717800000609616 |
| 327250000.0 |  |  | 717474422292848 |
| 327500000.0 |  |  | 717149337812880 |
| 327750000.0 |  |  | 716824746049440 |
| 328000000.0 |  |  | 716500645885584 |
| 328250000.0 |  |  | 716177036207776 |
| 328500000.0 |  |  | 715853915905856 |
| 328750000.0 |  |  | 715531283872944 |
| 329000000.0 |  |  | 715209139005504 |
| 329250000.0 |  |  | 714887480203360 |
| 329500000.0 |  |  | 714566306369568 |
| 329750000.0 |  |  | 714245616410560 |
| 330000000.0 |  |  | 713925409235968 |
| 330250000.0 |  |  | 713605683758720 |
| 330500000.0 |  |  | 713286438895056 |
| 330750000.0 |  |  | 712967673564320 |
| 331000000.0 |  |  | 712649386689232 |
| 331250000.0 |  |  | 712331577195632 |
| 331500000.0 |  |  | 712014244012624 |
| 331750000.0 |  |  | 711697386072464 |
| 332000000.0 |  |  | 711381002310640 |
| 332250000.0 |  |  | 711065091665760 |
| 332500000.0 |  |  | 710749653079600 |
| 332750000.0 |  |  | 710434685497120 |
| 333000000.0 |  |  | 710120187866368 |
| 333250000.0 |  |  | 709806159138528 |
| 333500000.0 |  |  | 709492598267904 |
| 333750000.0 |  |  | 709179504211936 |
| 334000000.0 |  |  | 708866875931088 |
| 334250000.0 |  |  | 708554712388960 |
| 334500000.0 |  |  | 708243012552144 |
| 334750000.0 |  |  | 707931775390368 |
| 335000000.0 |  |  | 707620999876352 |
| 335250000.0 |  |  | 707310684985856 |
| 335500000.0 |  |  | 707000829697696 |
| 335750000.0 |  |  | 706691432993664 |
| 336000000.0 |  |  | 706382493858544 |
| 336250000.0 |  |  | 706074011280144 |
| 336500000.0 |  |  | 705765984249216 |
| 336750000.0 |  |  | 705458411759472 |
| 337000000.0 |  |  | 705151292807632 |
| 337250000.0 |  |  | 704844626393312 |
| 337500000.0 |  |  | 704538411519072 |
| 337750000.0 |  |  | 704232647190416 |
| 338000000.0 |  |  | 703927332415728 |
| 338250000.0 |  |  | 703622466206336 |
| 338500000.0 |  |  | 703318047576400 |
| 338750000.0 |  |  | 703014075543008 |
| 339000000.0 |  |  | 702710549126112 |
| 339250000.0 |  |  | 702407467348480 |
| 339500000.0 |  |  | 702104829235824 |
| 339750000.0 |  |  | 701802633816576 |
| 340000000.0 |  |  | 701500880122128 |
| 340250000.0 |  |  | 701199567186544 |
| 340500000.0 |  |  | 700898694046816 |
| 340750000.0 |  |  | 700598259742672 |
| 341000000.0 |  |  | 700298263316672 |
| 341250000.0 |  |  | 699998703814080 |
| 341500000.0 |  |  | 699699580283008 |
| 341750000.0 |  |  | 699400891774272 |
| 342000000.0 |  |  | 699102637341504 |
| 342250000.0 |  |  | 698804816040960 |
| 342500000.0 |  |  | 698507426931728 |
| 342750000.0 |  |  | 698210469075568 |
| 343000000.0 |  |  | 697913941536960 |
| 343250000.0 |  |  | 697617843383072 |
| 343500000.0 |  |  | 697322173683760 |
| 343750000.0 |  |  | 697026931511616 |
| 344000000.0 |  |  | 696732115941792 |
| 344250000.0 |  |  | 696437726052192 |
| 344500000.0 |  |  | 696143760923312 |
| 344750000.0 |  |  | 695850219638352 |
| 345000000.0 |  |  | 695557101283088 |
| 345250000.0 |  |  | 695264404945936 |
| 345500000.0 |  |  | 694972129717936 |
| 345750000.0 |  |  | 694680274692720 |
| 346000000.0 |  |  | 694388838966544 |
| 346250000.0 |  |  | 694097821638144 |
| 346500000.0 |  |  | 693807221808976 |
| 346750000.0 |  |  | 693517038582976 |
| 347000000.0 |  |  | 693227271066656 |
| 347250000.0 |  |  | 692937918369072 |
| 347500000.0 |  |  | 692648979601840 |
| 347750000.0 |  |  | 692360453879072 |
| 348000000.0 |  |  | 692072340317440 |
| 348250000.0 |  |  | 691784638036064 |
| 348500000.0 |  |  | 691497346156672 |
| 348750000.0 |  |  | 691210463803376 |
| 349000000.0 |  |  | 690923990102832 |
| 349250000.0 |  |  | 690637924184192 |
| 349500000.0 |  |  | 690352265179040 |
| 349750000.0 |  |  | 690067012221392 |
| 350000000.0 |  |  | 689782164447776 |
| 350250000.0 |  |  | 689497720997136 |
| 350500000.0 |  |  | 689213681010832 |
| 350750000.0 |  |  | 688930043632688 |
| 351000000.0 |  |  | 688646808008912 |
| 351250000.0 |  |  | 688363973288160 |
| 351500000.0 |  |  | 688081538621392 |
| 351750000.0 |  |  | 687799503162096 |
| 352000000.0 |  |  | 687517866066016 |
| 352250000.0 |  |  | 687236626491360 |
| 352500000.0 |  |  | 686955783598624 |
| 352750000.0 |  |  | 686675336550752 |
| 353000000.0 |  |  | 686395284512960 |
| 353250000.0 |  |  | 686115626652880 |
| 353500000.0 |  |  | 685836362140368 |
| 353750000.0 |  |  | 685557490147696 |
| 354000000.0 |  |  | 685279009849424 |
| 354250000.0 |  |  | 685000920422432 |
| 354500000.0 |  |  | 684723221045856 |
| 354750000.0 |  |  | 684445910901216 |
| 355000000.0 |  |  | 684168989172224 |
| 355250000.0 |  |  | 683892455044896 |
| 355500000.0 |  |  | 683616307707520 |
| 355750000.0 |  |  | 683340546350656 |
| 356000000.0 |  |  | 683065170167136 |
| 356250000.0 |  |  | 682790178351984 |
| 356500000.0 |  |  | 682515570102480 |
| 356750000.0 |  |  | 682241344618176 |
| 357000000.0 |  |  | 681967501100768 |
| 357250000.0 |  |  | 681694038754240 |
| 357500000.0 |  |  | 681420956784736 |
| 357750000.0 |  |  | 681148254400608 |
| 358000000.0 |  |  | 680875930812432 |
| 358250000.0 |  |  | 680603985232928 |
| 358500000.0 |  |  | 680332416876992 |
| 358750000.0 |  |  | 680061224961744 |
| 359000000.0 |  |  | 679790408706368 |
| 359250000.0 |  |  | 679519967332272 |
| 359500000.0 |  |  | 679249900063024 |
| 359750000.0 |  |  | 678980206124288 |
| 360000000.0 |  |  | 678710884743840 |
| 360250000.0 |  |  | 678441935151664 |
| 360500000.0 |  |  | 678173356579792 |
| 360750000.0 |  |  | 677905148262368 |
| 361000000.0 |  |  | 677637309435696 |
| 361250000.0 |  |  | 677369839338080 |
| 361500000.0 |  |  | 677102737210000 |
| 361750000.0 |  |  | 676836002293984 |
| 362000000.0 |  |  | 676569633834640 |
| 362250000.0 |  |  | 676303631078608 |
| 362500000.0 |  |  | 676037993274656 |
| 362750000.0 |  |  | 675772719673536 |
| 363000000.0 |  |  | 675507809528064 |
| 363250000.0 |  |  | 675243262093120 |
| 363500000.0 |  |  | 674979076625616 |
| 363750000.0 |  |  | 674715252384464 |
| 364000000.0 |  |  | 674451788630576 |
| 364250000.0 |  |  | 674188684626960 |
| 364500000.0 |  |  | 673925939638544 |
| 364750000.0 |  |  | 673663552932256 |
| 365000000.0 |  |  | 673401523777072 |
| 365250000.0 |  |  | 673139851443904 |
| 365500000.0 |  |  | 672878535205680 |
| 365750000.0 |  |  | 672617574337264 |
| 366000000.0 |  |  | 672356968115456 |
| 366250000.0 |  |  | 672096715819152 |
| 366500000.0 |  |  | 671836816728992 |
| 366750000.0 |  |  | 671577270127728 |
| 367000000.0 |  |  | 671318075299984 |
| 367250000.0 |  |  | 671059231532304 |
| 367500000.0 |  |  | 670800738113200 |
| 367750000.0 |  |  | 670542594333040 |
| 368000000.0 |  |  | 670284799484176 |
| 368250000.0 |  |  | 670027352860864 |
| 368500000.0 |  |  | 669770253759120 |
| 368750000.0 |  |  | 669513501477008 |
| 369000000.0 |  |  | 669257095314448 |
| 369250000.0 |  |  | 669001034573200 |
| 369500000.0 |  |  | 668745318556912 |
| 369750000.0 |  |  | 668489946571104 |
| 370000000.0 |  |  | 668234917923184 |
| 370250000.0 |  |  | 667980231922336 |
| 370500000.0 |  |  | 667725887879680 |
| 370750000.0 |  |  | 667471885108128 |
| 371000000.0 |  |  | 667218222922448 |
| 371250000.0 |  |  | 666964900639248 |
| 371500000.0 |  |  | 666711917576912 |
| 371750000.0 |  |  | 666459273055712 |
| 372000000.0 |  |  | 666206966397664 |
| 372250000.0 |  |  | 665954996926624 |
| 372500000.0 |  |  | 665703363968272 |
| 372750000.0 |  |  | 665452066850000 |
| 373000000.0 |  |  | 665201104901120 |
| 373250000.0 |  |  | 664950477452560 |
| 373500000.0 |  |  | 664700183837168 |
| 373750000.0 |  |  | 664450223389536 |
| 374000000.0 |  |  | 664200595445920 |
| 374250000.0 |  |  | 663951299344448 |
| 374500000.0 |  |  | 663702334424944 |
| 374750000.0 |  |  | 663453700028992 |
| 375000000.0 |  |  | 663205395499936 |
| 375250000.0 |  |  | 662957420182832 |
| 375500000.0 |  |  | 662709773424480 |
| 375750000.0 |  |  | 662462454573376 |
| 376000000.0 |  |  | 662215462979760 |
| 376250000.0 |  |  | 661968797995600 |
| 376500000.0 |  |  | 661722458974528 |
| 376750000.0 |  |  | 661476445271904 |
| 377000000.0 |  |  | 661230756244784 |
| 377250000.0 |  |  | 660985391251920 |
| 377500000.0 |  |  | 660740349653728 |
| 377750000.0 |  |  | 660495630812336 |
| 378000000.0 |  |  | 660251234091488 |
| 378250000.0 |  |  | 660007158856624 |
| 378500000.0 |  |  | 659763404474928 |
| 378750000.0 |  |  | 659519970315104 |
| 379000000.0 |  |  | 659276855747600 |
| 379250000.0 |  |  | 659034060144496 |
| 379500000.0 |  |  | 658791582879440 |
| 379750000.0 |  |  | 658549423327840 |
| 380000000.0 |  |  | 658307580866640 |
| 380250000.0 |  |  | 658066054874480 |
| 380500000.0 |  |  | 657824844731520 |
| 380750000.0 |  |  | 657583949819648 |
| 381000000.0 |  |  | 657343369522288 |
| 381250000.0 |  |  | 657103103224512 |
| 381500000.0 |  |  | 656863150312928 |
| 381750000.0 |  |  | 656623510175792 |
| 382000000.0 |  |  | 656384182202944 |
| 382250000.0 |  |  | 656145165785808 |
| 382500000.0 |  |  | 655906460317344 |
| 382750000.0 |  |  | 655668065192144 |
| 383000000.0 |  |  | 655429979806352 |
| 383250000.0 |  |  | 655192203557648 |
| 383500000.0 |  |  | 654954735845280 |
| 383750000.0 |  |  | 654717576070064 |
| 384000000.0 |  |  | 654480723634352 |
| 384250000.0 |  |  | 654244177942064 |
| 384500000.0 |  |  | 654007938398624 |
| 384750000.0 |  |  | 653772004411008 |
| 385000000.0 |  |  | 653536375387712 |
| 385250000.0 |  |  | 653301050738752 |
| 385500000.0 |  |  | 653066029875680 |
| 385750000.0 |  |  | 652831312211552 |
| 386000000.0 |  |  | 652596897160912 |
| 386250000.0 |  |  | 652362784139856 |
| 386500000.0 |  |  | 652128972565920 |
| 386750000.0 |  |  | 651895461858208 |
| 387000000.0 |  |  | 651662251437216 |
| 387250000.0 |  |  | 651429340725008 |
| 387500000.0 |  |  | 651196729145104 |
| 387750000.0 |  |  | 650964416122480 |
| 388000000.0 |  |  | 650732401083616 |
| 388250000.0 |  |  | 650500683456416 |
| 388500000.0 |  |  | 650269262670288 |
| 388750000.0 |  |  | 650038138156048 |
| 389000000.0 |  |  | 649807309346032 |
| 389250000.0 |  |  | 649576775673936 |
| 389500000.0 |  |  | 649346536574960 |
| 389750000.0 |  |  | 649116591485760 |
| 390000000.0 |  |  | 648886939844368 |
| 390250000.0 |  |  | 648657581090272 |
| 390500000.0 |  |  | 648428514664400 |
| 390750000.0 |  |  | 648199740009056 |
| 391000000.0 |  |  | 647971256567984 |
| 391250000.0 |  |  | 647743063786352 |
| 391500000.0 |  |  | 647515161110736 |
| 391750000.0 |  |  | 647287547989072 |
| 392000000.0 |  |  | 647060223870768 |
| 392250000.0 |  |  | 646833188206544 |
| 392500000.0 |  |  | 646606440448576 |
| 392750000.0 |  |  | 646379980050336 |
| 393000000.0 |  |  | 646153806466784 |
| 393250000.0 |  |  | 645927919154208 |
| 393500000.0 |  |  | 645702317570224 |
| 393750000.0 |  |  | 645477001173872 |
| 394000000.0 |  |  | 645251969425552 |
| 394250000.0 |  |  | 645027221787024 |
| 394500000.0 |  |  | 644802757721344 |
| 394750000.0 |  |  | 644578576692976 |
| 395000000.0 |  |  | 644354678167728 |
| 395250000.0 |  |  | 644131061612736 |
| 395500000.0 |  |  | 643907726496448 |
| 395750000.0 |  |  | 643684672288688 |
| 396000000.0 |  |  | 643461898460608 |
| 396250000.0 |  |  | 643239404484640 |
| 396500000.0 |  |  | 643017189834576 |
| 396750000.0 |  |  | 642795253985504 |
| 397000000.0 |  |  | 642573596413856 |
| 397250000.0 |  |  | 642352216597328 |
| 397500000.0 |  |  | 642131114014944 |
| 397750000.0 |  |  | 641910288147040 |
| 398000000.0 |  |  | 641689738475232 |
| 398250000.0 |  |  | 641469464482432 |
| 398500000.0 |  |  | 641249465652832 |
| 398750000.0 |  |  | 641029741471888 |
| 399000000.0 |  |  | 640810291426400 |
| 399250000.0 |  |  | 640591115004416 |
| 399500000.0 |  |  | 640372211695216 |
| 399750000.0 |  |  | 640153580989376 |
| 400000000.0 |  |  | 639935222378784 |
| 400250000.0 |  |  | 639717135356512 |
| 400500000.0 |  |  | 639499319416912 |
| 400750000.0 |  |  | 639281774055616 |
| 401000000.0 |  |  | 639064498769456 |
| 401250000.0 |  |  | 638847493056560 |
| 401500000.0 |  |  | 638630756416304 |
| 401750000.0 |  |  | 638414288349248 |
| 402000000.0 |  |  | 638198088357184 |
| 402250000.0 |  |  | 637982155943200 |
| 402500000.0 |  |  | 637766490611536 |
| 402750000.0 |  |  | 637551091867712 |
| 403000000.0 |  |  | 637335959218416 |
| 403250000.0 |  |  | 637121092171616 |
| 403500000.0 |  |  | 636906490236432 |
| 403750000.0 |  |  | 636692152923200 |
| 404000000.0 |  |  | 636478079743472 |
| 404250000.0 |  |  | 636264270210016 |
| 404500000.0 |  |  | 636050723836736 |
| 404750000.0 |  |  | 635837440138832 |
| 405000000.0 |  |  | 635624418632576 |
| 405250000.0 |  |  | 635411658835488 |
| 405500000.0 |  |  | 635199160266304 |
| 405750000.0 |  |  | 634986922444816 |
| 406000000.0 |  |  | 634774944892144 |
| 406250000.0 |  |  | 634563227130480 |
| 406500000.0 |  |  | 634351768683184 |
| 406750000.0 |  |  | 634140569074816 |
| 407000000.0 |  |  | 633929627831088 |
| 407250000.0 |  |  | 633718944478880 |
| 407500000.0 |  |  | 633508518546176 |
| 407750000.0 |  |  | 633298349562144 |
| 408000000.0 |  |  | 633088437057104 |
| 408250000.0 |  |  | 632878780562512 |
| 408500000.0 |  |  | 632669379610928 |
| 408750000.0 |  |  | 632460233736144 |
| 409000000.0 |  |  | 632251342472960 |
| 409250000.0 |  |  | 632042705357408 |
| 409500000.0 |  |  | 631834321926560 |
| 409750000.0 |  |  | 631626191718704 |
| 410000000.0 |  |  | 631418314273120 |
| 410250000.0 |  |  | 631210689130336 |
| 410500000.0 |  |  | 631003315831920 |
| 410750000.0 |  |  | 630796193920560 |
| 411000000.0 |  |  | 630589322940048 |
| 411250000.0 |  |  | 630382702435296 |
| 411500000.0 |  |  | 630176331952256 |
| 411750000.0 |  |  | 629970211038064 |
| 412000000.0 |  |  | 629764339240864 |
| 412250000.0 |  |  | 629558716109920 |
| 412500000.0 |  |  | 629353341195664 |
| 412750000.0 |  |  | 629148214049440 |
| 413000000.0 |  |  | 628943334223824 |
| 413250000.0 |  |  | 628738701272368 |
| 413500000.0 |  |  | 628534314749744 |
| 413750000.0 |  |  | 628330174211680 |
| 414000000.0 |  |  | 628126279215008 |
| 414250000.0 |  |  | 627922629317552 |
| 414500000.0 |  |  | 627719224078256 |
| 414750000.0 |  |  | 627516063057056 |
| 415000000.0 |  |  | 627313145815056 |
| 415250000.0 |  |  | 627110471914272 |
| 415500000.0 |  |  | 626908040917824 |
| 415750000.0 |  |  | 626705852389936 |
| 416000000.0 |  |  | 626503905895776 |
| 416250000.0 |  |  | 626302201001584 |
| 416500000.0 |  |  | 626100737274688 |
| 416750000.0 |  |  | 625899514283376 |
| 417000000.0 |  |  | 625698531596992 |
| 417250000.0 |  |  | 625497788785872 |
| 417500000.0 |  |  | 625297285421456 |
| 417750000.0 |  |  | 625097021076144 |
| 418000000.0 |  |  | 624896995323312 |
| 418250000.0 |  |  | 624697207737456 |
| 418500000.0 |  |  | 624497657894016 |
| 418750000.0 |  |  | 624298345369408 |
| 419000000.0 |  |  | 624099269741136 |
| 419250000.0 |  |  | 623900430587632 |
| 419500000.0 |  |  | 623701827488368 |
| 419750000.0 |  |  | 623503460023776 |
| 420000000.0 |  |  | 623305327775328 |
| 420250000.0 |  |  | 623107430325456 |
| 420500000.0 |  |  | 622909767257616 |
| 420750000.0 |  |  | 622712338156112 |
| 421000000.0 |  |  | 622515142606416 |
| 421250000.0 |  |  | 622318180194880 |
| 421500000.0 |  |  | 622121450508816 |
| 421750000.0 |  |  | 621924953136560 |
| 422000000.0 |  |  | 621728687667392 |
| 422250000.0 |  |  | 621532653691520 |
| 422500000.0 |  |  | 621336850800240 |
| 422750000.0 |  |  | 621141278585616 |
| 423000000.0 |  |  | 620945936640848 |
| 423250000.0 |  |  | 620750824560000 |
| 423500000.0 |  |  | 620555941938096 |
| 423750000.0 |  |  | 620361288371152 |
| 424000000.0 |  |  | 620166863456048 |
| 424250000.0 |  |  | 619972666790736 |
| 424500000.0 |  |  | 619778697973952 |
| 424750000.0 |  |  | 619584956605520 |
| 425000000.0 |  |  | 619391442286080 |
| 425250000.0 |  |  | 619198154617264 |
| 425500000.0 |  |  | 619005093201664 |
| 425750000.0 |  |  | 618812257642736 |
| 426000000.0 |  |  | 618619647544880 |
| 426250000.0 |  |  | 618427262513456 |
| 426500000.0 |  |  | 618235102154656 |
| 426750000.0 |  |  | 618043166075696 |
| 427000000.0 |  |  | 617851453884608 |
| 427250000.0 |  |  | 617659965190448 |
| 427500000.0 |  |  | 617468699603072 |
| 427750000.0 |  |  | 617277656733280 |
| 428000000.0 |  |  | 617086836192832 |
| 428250000.0 |  |  | 616896237594256 |
| 428500000.0 |  |  | 616705860551136 |
| 428750000.0 |  |  | 616515704677808 |
| 429000000.0 |  |  | 616325769589648 |
| 429250000.0 |  |  | 616136054902768 |
| 429500000.0 |  |  | 615946560234304 |
| 429750000.0 |  |  | 615757285202176 |
| 430000000.0 |  |  | 615568229425264 |
| 430250000.0 |  |  | 615379392523264 |
| 430500000.0 |  |  | 615190774116784 |
| 430750000.0 |  |  | 615002373827280 |
| 431000000.0 |  |  | 614814191277152 |
| 431250000.0 |  |  | 614626226089584 |
| 431500000.0 |  |  | 614438477888672 |
| 431750000.0 |  |  | 614250946299392 |
| 432000000.0 |  |  | 614063630947520 |
| 432250000.0 |  |  | 613876531459760 |
| 432500000.0 |  |  | 613689647463632 |
| 432750000.0 |  |  | 613502978587552 |
| 433000000.0 |  |  | 613316524460720 |
| 433250000.0 |  |  | 613130284713248 |
| 433500000.0 |  |  | 612944258976112 |
| 433750000.0 |  |  | 612758446881056 |
| 434000000.0 |  |  | 612572848060704 |
| 434250000.0 |  |  | 612387462148544 |
| 434500000.0 |  |  | 612202288778896 |
| 434750000.0 |  |  | 612017327586896 |
| 435000000.0 |  |  | 611832578208496 |
| 435250000.0 |  |  | 611648040280544 |
| 435500000.0 |  |  | 611463713440672 |
| 435750000.0 |  |  | 611279597327328 |
| 436000000.0 |  |  | 611095691579792 |
| 436250000.0 |  |  | 610911995838208 |
| 436500000.0 |  |  | 610728509743472 |
| 436750000.0 |  |  | 610545232937360 |
| 437000000.0 |  |  | 610362165062432 |
| 437250000.0 |  |  | 610179305762048 |
| 437500000.0 |  |  | 609996654680400 |
| 437750000.0 |  |  | 609814211462464 |
| 438000000.0 |  |  | 609631975754064 |
| 438250000.0 |  |  | 609449947201792 |
| 438500000.0 |  |  | 609268125453024 |
| 438750000.0 |  |  | 609086510156000 |
| 439000000.0 |  |  | 608905100959728 |
| 439250000.0 |  |  | 608723897513968 |
| 439500000.0 |  |  | 608542899469280 |
| 439750000.0 |  |  | 608362106477104 |
| 440000000.0 |  |  | 608181518189552 |
| 440250000.0 |  |  | 608001134259600 |
| 440500000.0 |  |  | 607820954340960 |
| 440750000.0 |  |  | 607640978088128 |
| 441000000.0 |  |  | 607461205156448 |
| 441250000.0 |  |  | 607281635201936 |
| 441500000.0 |  |  | 607102267881440 |
| 441750000.0 |  |  | 606923102852592 |
| 442000000.0 |  |  | 606744139773760 |
| 442250000.0 |  |  | 606565378304096 |
| 442500000.0 |  |  | 606386818103504 |
| 442750000.0 |  |  | 606208458832720 |
| 443000000.0 |  |  | 606030300153120 |
| 443250000.0 |  |  | 605852341726912 |
| 443500000.0 |  |  | 605674583217088 |
| 443750000.0 |  |  | 605497024287328 |
| 444000000.0 |  |  | 605319664602128 |
| 444250000.0 |  |  | 605142503826688 |
| 444500000.0 |  |  | 604965541626944 |
| 444750000.0 |  |  | 604788777669680 |
| 445000000.0 |  |  | 604612211622288 |
| 445250000.0 |  |  | 604435843152992 |
| 445500000.0 |  |  | 604259671930736 |
| 445750000.0 |  |  | 604083697625168 |
| 446000000.0 |  |  | 603907919906752 |
| 446250000.0 |  |  | 603732338446592 |
| 446500000.0 |  |  | 603556952916592 |
| 446750000.0 |  |  | 603381762989344 |
| 447000000.0 |  |  | 603206768338192 |
| 447250000.0 |  |  | 603031968637216 |
| 447500000.0 |  |  | 602857363561200 |
| 447750000.0 |  |  | 602682952785632 |
| 448000000.0 |  |  | 602508735986784 |
| 448250000.0 |  |  | 602334712841568 |
| 448500000.0 |  |  | 602160883027664 |
| 448750000.0 |  |  | 601987246223456 |
| 449000000.0 |  |  | 601813802108032 |
| 449250000.0 |  |  | 601640550361184 |
| 449500000.0 |  |  | 601467490663440 |
| 449750000.0 |  |  | 601294622696000 |
| 450000000.0 |  |  | 601121946140768 |
| 450250000.0 |  |  | 600949460680448 |
| 450500000.0 |  |  | 600777165998256 |
| 450750000.0 |  |  | 600605061778288 |
| 451000000.0 |  |  | 600433147705216 |
| 451250000.0 |  |  | 600261423464496 |
| 451500000.0 |  |  | 600089888742208 |
| 451750000.0 |  |  | 599918543225152 |
| 452000000.0 |  |  | 599747386600816 |
| 452250000.0 |  |  | 599576418557392 |
| 452500000.0 |  |  | 599405638783712 |
| 452750000.0 |  |  | 599235046969296 |
| 453000000.0 |  |  | 599064642804432 |
| 453250000.0 |  |  | 598894425979968 |
| 453500000.0 |  |  | 598724396187504 |
| 453750000.0 |  |  | 598554553119312 |
| 454000000.0 |  |  | 598384896468288 |
| 454250000.0 |  |  | 598215425928064 |
| 454500000.0 |  |  | 598046141192896 |
| 454750000.0 |  |  | 597877041957712 |
| 455000000.0 |  |  | 597708127918160 |
| 455250000.0 |  |  | 597539398770480 |
| 455500000.0 |  |  | 597370854211616 |
| 455750000.0 |  |  | 597202493939168 |
| 456000000.0 |  |  | 597034317651424 |
| 456250000.0 |  |  | 596866325047232 |
| 456500000.0 |  |  | 596698515826192 |
| 456750000.0 |  |  | 596530889688528 |
| 457000000.0 |  |  | 596363446335152 |
| 457250000.0 |  |  | 596196185467520 |
| 457500000.0 |  |  | 596029106787872 |
| 457750000.0 |  |  | 595862209999008 |
| 458000000.0 |  |  | 595695494804384 |
| 458250000.0 |  |  | 595528960908112 |
| 458500000.0 |  |  | 595362608014960 |
| 458750000.0 |  |  | 595196435830304 |
| 459000000.0 |  |  | 595030444060208 |
| 459250000.0 |  |  | 594864632411296 |
| 459500000.0 |  |  | 594699000590912 |
| 459750000.0 |  |  | 594533548306976 |
| 460000000.0 |  |  | 594368275268032 |
| 460250000.0 |  |  | 594203181183312 |
| 460500000.0 |  |  | 594038265762624 |
| 460750000.0 |  |  | 593873528716432 |
| 461000000.0 |  |  | 593708969755776 |
| 461250000.0 |  |  | 593544588592400 |
| 461500000.0 |  |  | 593380384938624 |
| 461750000.0 |  |  | 593216358507344 |
| 462000000.0 |  |  | 593052509012144 |
| 462250000.0 |  |  | 592888836167216 |
| 462500000.0 |  |  | 592725339687312 |
| 462750000.0 |  |  | 592562019287856 |
| 463000000.0 |  |  | 592398874684864 |
| 463250000.0 |  |  | 592235905594960 |
| 463500000.0 |  |  | 592073111735392 |
| 463750000.0 |  |  | 591910492823920 |
| 464000000.0 |  |  | 591748048579072 |
| 464250000.0 |  |  | 591585778719856 |
| 464500000.0 |  |  | 591423682965936 |
| 464750000.0 |  |  | 591261761037520 |
| 465000000.0 |  |  | 591100012655520 |
| 465250000.0 |  |  | 590938437541312 |
| 465500000.0 |  |  | 590777035416976 |
| 465750000.0 |  |  | 590615806005104 |
| 466000000.0 |  |  | 590454749028976 |
| 466250000.0 |  |  | 590293864212352 |
| 466500000.0 |  |  | 590133151279648 |
| 466750000.0 |  |  | 589972609955856 |
| 467000000.0 |  |  | 589812239966560 |
| 467250000.0 |  |  | 589652041037936 |
| 467500000.0 |  |  | 589492012896688 |
| 467750000.0 |  |  | 589332155270160 |
| 468000000.0 |  |  | 589172467886240 |
| 468250000.0 |  |  | 589012950473424 |
| 468500000.0 |  |  | 588853602760784 |
| 468750000.0 |  |  | 588694424477904 |
| 469000000.0 |  |  | 588535415355040 |
| 469250000.0 |  |  | 588376575122944 |
| 469500000.0 |  |  | 588217903512960 |
| 469750000.0 |  |  | 588059400257008 |
| 470000000.0 |  |  | 587901065087584 |
| 470250000.0 |  |  | 587742897737728 |
| 470500000.0 |  |  | 587584897941056 |
| 470750000.0 |  |  | 587427065431744 |
| 471000000.0 |  |  | 587269399944560 |
| 471250000.0 |  |  | 587111901214752 |
| 471500000.0 |  |  | 586954568978208 |
| 471750000.0 |  |  | 586797402971328 |
| 472000000.0 |  |  | 586640402931104 |
| 472250000.0 |  |  | 586483568595024 |
| 472500000.0 |  |  | 586326899701184 |
| 472750000.0 |  |  | 586170395988240 |
| 473000000.0 |  |  | 586014057195312 |
| 473250000.0 |  |  | 585857883062160 |
| 473500000.0 |  |  | 585701873329056 |
| 473750000.0 |  |  | 585546027736816 |
| 474000000.0 |  |  | 585390346026784 |
| 474250000.0 |  |  | 585234827940896 |
| 474500000.0 |  |  | 585079473221584 |
| 474750000.0 |  |  | 584924281611808 |
| 475000000.0 |  |  | 584769252855120 |
| 475250000.0 |  |  | 584614386695584 |
| 475500000.0 |  |  | 584459682877744 |
| 475750000.0 |  |  | 584305141146800 |
| 476000000.0 |  |  | 584150761248368 |
| 476250000.0 |  |  | 583996542928672 |
| 476500000.0 |  |  | 583842485934432 |
| 476750000.0 |  |  | 583688590012880 |
| 477000000.0 |  |  | 583534854911792 |
| 477250000.0 |  |  | 583381280379472 |
| 477500000.0 |  |  | 583227866164784 |
| 477750000.0 |  |  | 583074612017040 |
| 478000000.0 |  |  | 582921517686160 |
| 478250000.0 |  |  | 582768582922496 |
| 478500000.0 |  |  | 582615807476976 |
| 478750000.0 |  |  | 582463191101040 |
| 479000000.0 |  |  | 582310733546624 |
| 479250000.0 |  |  | 582158434566176 |
| 479500000.0 |  |  | 582006293912704 |
| 479750000.0 |  |  | 581854311339680 |
| 480000000.0 |  |  | 581702486601088 |
| 480250000.0 |  |  | 581550819451488 |
| 480500000.0 |  |  | 581399309645856 |
| 480750000.0 |  |  | 581247956939712 |
| 481000000.0 |  |  | 581096761089088 |
| 481250000.0 |  |  | 580945721850528 |
| 481500000.0 |  |  | 580794838981088 |
| 481750000.0 |  |  | 580644112238304 |
| 482000000.0 |  |  | 580493541380160 |
| 482250000.0 |  |  | 580343126165280 |
| 482500000.0 |  |  | 580192866352640 |
| 482750000.0 |  |  | 580042761701760 |
| 483000000.0 |  |  | 579892811972704 |
| 483250000.0 |  |  | 579743016925984 |
| 483500000.0 |  |  | 579593376322656 |
| 483750000.0 |  |  | 579443889924192 |
| 484000000.0 |  |  | 579294557492576 |
| 484250000.0 |  |  | 579145378790304 |
| 484500000.0 |  |  | 578996353580352 |
| 484750000.0 |  |  | 578847481626208 |
| 485000000.0 |  |  | 578698762691776 |
| 485250000.0 |  |  | 578550196541504 |
| 485500000.0 |  |  | 578401782940288 |
| 485750000.0 |  |  | 578253521653600 |
| 486000000.0 |  |  | 578105412447232 |
| 486250000.0 |  |  | 577957455087520 |
| 486500000.0 |  |  | 577809649341376 |
| 486750000.0 |  |  | 577661994976096 |
| 487000000.0 |  |  | 577514491759392 |
| 487250000.0 |  |  | 577367139459584 |
| 487500000.0 |  |  | 577219937845376 |
| 487750000.0 |  |  | 577072886686048 |
| 488000000.0 |  |  | 576925985751168 |
| 488250000.0 |  |  | 576779234810912 |
| 488500000.0 |  |  | 576632633635904 |
| 488750000.0 |  |  | 576486181997216 |
| 489000000.0 |  |  | 576339879666432 |
| 489250000.0 |  |  | 576193726415520 |
| 489500000.0 |  |  | 576047722016960 |
| 489750000.0 |  |  | 575901866243648 |
| 490000000.0 |  |  | 575756158869088 |
| 490250000.0 |  |  | 575610599667008 |
| 490500000.0 |  |  | 575465188411776 |
| 490750000.0 |  |  | 575319924878240 |
| 491000000.0 |  |  | 575174808841536 |
| 491250000.0 |  |  | 575029840077344 |
| 491500000.0 |  |  | 574885018361824 |
| 491750000.0 |  |  | 574740343471584 |
| 492000000.0 |  |  | 574595815183648 |
| 492250000.0 |  |  | 574451433275552 |
| 492500000.0 |  |  | 574307197525216 |
| 492750000.0 |  |  | 574163107711008 |
| 493000000.0 |  |  | 574019163611776 |
| 493250000.0 |  |  | 573875365006816 |
| 493500000.0 |  |  | 573731711675904 |
| 493750000.0 |  |  | 573588203399072 |
| 494000000.0 |  |  | 573444839957120 |
| 494250000.0 |  |  | 573301621130976 |
| 494500000.0 |  |  | 573158546702208 |
| 494750000.0 |  |  | 573015616452768 |
| 495000000.0 |  |  | 572872830164928 |
| 495250000.0 |  |  | 572730187621632 |
| 495500000.0 |  |  | 572587688606048 |
| 495750000.0 |  |  | 572445332901920 |
| 496000000.0 |  |  | 572303120293312 |
| 496250000.0 |  |  | 572161050564832 |
| 496500000.0 |  |  | 572019123501440 |
| 496750000.0 |  |  | 571877338888544 |
| 497000000.0 |  |  | 571735696512000 |
| 497250000.0 |  |  | 571594196158048 |
| 497500000.0 |  |  | 571452837613504 |
| 497750000.0 |  |  | 571311620665376 |
| 498000000.0 |  |  | 571170545101248 |
| 498250000.0 |  |  | 571029610709152 |
| 498500000.0 |  |  | 570888817277376 |
| 498750000.0 |  |  | 570748164594912 |
| 499000000.0 |  |  | 570607652450848 |
| 499250000.0 |  |  | 570467280634944 |
| 499500000.0 |  |  | 570327048937216 |
| 499750000.0 |  |  | 570186957148256 |
| 500000000.0 |  |  | 570047005058944 |